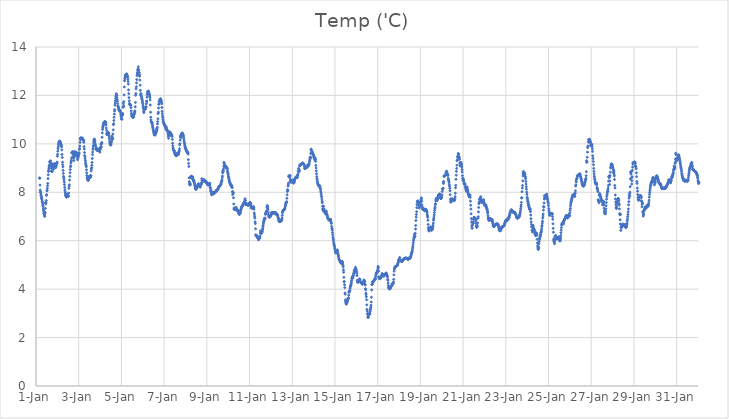
| Category | Temp ('C) |
|---|---|
| 44927.166666666664 | 8.597 |
| 44927.177083333336 | 8.574 |
| 44927.1875 | 8.298 |
| 44927.197916666664 | 8.091 |
| 44927.208333333336 | 8.01 |
| 44927.21875 | 8.003 |
| 44927.229166666664 | 7.937 |
| 44927.239583333336 | 7.87 |
| 44927.25 | 7.82 |
| 44927.260416666664 | 7.769 |
| 44927.270833333336 | 7.728 |
| 44927.28125 | 7.687 |
| 44927.291666666664 | 7.626 |
| 44927.302083333336 | 7.58 |
| 44927.3125 | 7.517 |
| 44927.322916666664 | 7.456 |
| 44927.333333333336 | 7.403 |
| 44927.34375 | 7.31 |
| 44927.354166666664 | 7.248 |
| 44927.364583333336 | 7.188 |
| 44927.375 | 7.131 |
| 44927.385416666664 | 7.114 |
| 44927.395833333336 | 7.039 |
| 44927.40625 | 7.006 |
| 44927.416666666664 | 7.11 |
| 44927.427083333336 | 7.167 |
| 44927.4375 | 7.335 |
| 44927.447916666664 | 7.564 |
| 44927.458333333336 | 7.52 |
| 44927.46875 | 7.586 |
| 44927.479166666664 | 7.659 |
| 44927.489583333336 | 7.872 |
| 44927.5 | 7.902 |
| 44927.510416666664 | 8.062 |
| 44927.520833333336 | 8.07 |
| 44927.53125 | 8.162 |
| 44927.541666666664 | 8.268 |
| 44927.552083333336 | 8.366 |
| 44927.5625 | 8.565 |
| 44927.572916666664 | 8.722 |
| 44927.583333333336 | 8.859 |
| 44927.59375 | 8.916 |
| 44927.604166666664 | 8.991 |
| 44927.614583333336 | 9.06 |
| 44927.625 | 9.103 |
| 44927.635416666664 | 9.129 |
| 44927.645833333336 | 9.266 |
| 44927.65625 | 9.241 |
| 44927.666666666664 | 9.242 |
| 44927.677083333336 | 9.301 |
| 44927.6875 | 9.19 |
| 44927.697916666664 | 9.114 |
| 44927.708333333336 | 9.071 |
| 44927.71875 | 8.99 |
| 44927.729166666664 | 8.885 |
| 44927.739583333336 | 8.86 |
| 44927.75 | 8.853 |
| 44927.760416666664 | 8.885 |
| 44927.770833333336 | 9.034 |
| 44927.78125 | 9.079 |
| 44927.791666666664 | 9.177 |
| 44927.802083333336 | 9.139 |
| 44927.8125 | 9.042 |
| 44927.822916666664 | 8.965 |
| 44927.833333333336 | 9.037 |
| 44927.84375 | 9.096 |
| 44927.854166666664 | 9.134 |
| 44927.864583333336 | 9.171 |
| 44927.875 | 9.176 |
| 44927.885416666664 | 9.139 |
| 44927.895833333336 | 9.076 |
| 44927.90625 | 9.078 |
| 44927.916666666664 | 9.014 |
| 44927.927083333336 | 9.057 |
| 44927.9375 | 9.12 |
| 44927.947916666664 | 9.083 |
| 44927.958333333336 | 9.163 |
| 44927.96875 | 9.212 |
| 44927.979166666664 | 9.198 |
| 44927.989583333336 | 9.247 |
| 44928.0 | 9.489 |
| 44928.010416666664 | 9.567 |
| 44928.020833333336 | 9.696 |
| 44928.03125 | 9.805 |
| 44928.041666666664 | 9.88 |
| 44928.052083333336 | 9.96 |
| 44928.0625 | 10.023 |
| 44928.072916666664 | 10.043 |
| 44928.083333333336 | 10.069 |
| 44928.09375 | 10.095 |
| 44928.104166666664 | 10.111 |
| 44928.114583333336 | 10.109 |
| 44928.125 | 10.095 |
| 44928.135416666664 | 10.062 |
| 44928.145833333336 | 10.047 |
| 44928.15625 | 10.026 |
| 44928.166666666664 | 9.985 |
| 44928.177083333336 | 9.968 |
| 44928.1875 | 9.918 |
| 44928.197916666664 | 9.877 |
| 44928.208333333336 | 9.75 |
| 44928.21875 | 9.565 |
| 44928.229166666664 | 9.439 |
| 44928.239583333336 | 9.241 |
| 44928.25 | 9.139 |
| 44928.260416666664 | 9.048 |
| 44928.270833333336 | 8.906 |
| 44928.28125 | 8.78 |
| 44928.291666666664 | 8.653 |
| 44928.302083333336 | 8.597 |
| 44928.3125 | 8.526 |
| 44928.322916666664 | 8.428 |
| 44928.333333333336 | 8.322 |
| 44928.34375 | 8.205 |
| 44928.354166666664 | 8.104 |
| 44928.364583333336 | 8.021 |
| 44928.375 | 7.962 |
| 44928.385416666664 | 7.9 |
| 44928.395833333336 | 7.863 |
| 44928.40625 | 7.836 |
| 44928.416666666664 | 7.818 |
| 44928.427083333336 | 7.807 |
| 44928.4375 | 7.809 |
| 44928.447916666664 | 7.931 |
| 44928.458333333336 | 7.845 |
| 44928.46875 | 7.857 |
| 44928.479166666664 | 7.848 |
| 44928.489583333336 | 7.824 |
| 44928.5 | 7.828 |
| 44928.510416666664 | 7.868 |
| 44928.520833333336 | 7.851 |
| 44928.53125 | 7.967 |
| 44928.541666666664 | 8.162 |
| 44928.552083333336 | 8.256 |
| 44928.5625 | 8.308 |
| 44928.572916666664 | 8.503 |
| 44928.583333333336 | 8.657 |
| 44928.59375 | 8.806 |
| 44928.604166666664 | 8.938 |
| 44928.614583333336 | 9.049 |
| 44928.625 | 9.095 |
| 44928.635416666664 | 9.212 |
| 44928.645833333336 | 9.281 |
| 44928.65625 | 9.329 |
| 44928.666666666664 | 9.421 |
| 44928.677083333336 | 9.629 |
| 44928.6875 | 9.644 |
| 44928.697916666664 | 9.641 |
| 44928.708333333336 | 9.681 |
| 44928.71875 | 9.668 |
| 44928.729166666664 | 9.61 |
| 44928.739583333336 | 9.55 |
| 44928.75 | 9.468 |
| 44928.760416666664 | 9.413 |
| 44928.770833333336 | 9.311 |
| 44928.78125 | 9.442 |
| 44928.791666666664 | 9.641 |
| 44928.802083333336 | 9.681 |
| 44928.8125 | 9.645 |
| 44928.822916666664 | 9.545 |
| 44928.833333333336 | 9.517 |
| 44928.84375 | 9.55 |
| 44928.854166666664 | 9.598 |
| 44928.864583333336 | 9.66 |
| 44928.875 | 9.647 |
| 44928.885416666664 | 9.646 |
| 44928.895833333336 | 9.644 |
| 44928.90625 | 9.63 |
| 44928.916666666664 | 9.604 |
| 44928.927083333336 | 9.534 |
| 44928.9375 | 9.47 |
| 44928.947916666664 | 9.346 |
| 44928.958333333336 | 9.406 |
| 44928.96875 | 9.448 |
| 44928.979166666664 | 9.484 |
| 44928.989583333336 | 9.533 |
| 44929.0 | 9.596 |
| 44929.010416666664 | 9.565 |
| 44929.020833333336 | 9.631 |
| 44929.03125 | 9.767 |
| 44929.041666666664 | 9.81 |
| 44929.052083333336 | 9.912 |
| 44929.0625 | 10.06 |
| 44929.072916666664 | 10.179 |
| 44929.083333333336 | 10.229 |
| 44929.09375 | 10.247 |
| 44929.104166666664 | 10.238 |
| 44929.114583333336 | 10.231 |
| 44929.125 | 10.231 |
| 44929.135416666664 | 10.215 |
| 44929.145833333336 | 10.223 |
| 44929.15625 | 10.232 |
| 44929.166666666664 | 10.242 |
| 44929.177083333336 | 10.217 |
| 44929.1875 | 10.185 |
| 44929.197916666664 | 10.157 |
| 44929.208333333336 | 10.163 |
| 44929.21875 | 10.157 |
| 44929.229166666664 | 10.138 |
| 44929.239583333336 | 10.063 |
| 44929.25 | 9.888 |
| 44929.260416666664 | 9.787 |
| 44929.270833333336 | 9.64 |
| 44929.28125 | 9.515 |
| 44929.291666666664 | 9.467 |
| 44929.302083333336 | 9.379 |
| 44929.3125 | 9.301 |
| 44929.322916666664 | 9.214 |
| 44929.333333333336 | 9.156 |
| 44929.34375 | 9.106 |
| 44929.354166666664 | 9.05 |
| 44929.364583333336 | 8.927 |
| 44929.375 | 8.805 |
| 44929.385416666664 | 8.692 |
| 44929.395833333336 | 8.608 |
| 44929.40625 | 8.563 |
| 44929.416666666664 | 8.53 |
| 44929.427083333336 | 8.51 |
| 44929.4375 | 8.502 |
| 44929.447916666664 | 8.498 |
| 44929.458333333336 | 8.501 |
| 44929.46875 | 8.637 |
| 44929.479166666664 | 8.619 |
| 44929.489583333336 | 8.611 |
| 44929.5 | 8.604 |
| 44929.510416666664 | 8.663 |
| 44929.520833333336 | 8.605 |
| 44929.53125 | 8.667 |
| 44929.541666666664 | 8.68 |
| 44929.552083333336 | 8.621 |
| 44929.5625 | 8.682 |
| 44929.572916666664 | 8.684 |
| 44929.583333333336 | 8.882 |
| 44929.59375 | 8.961 |
| 44929.604166666664 | 9.016 |
| 44929.614583333336 | 9.115 |
| 44929.625 | 9.234 |
| 44929.635416666664 | 9.394 |
| 44929.645833333336 | 9.555 |
| 44929.65625 | 9.662 |
| 44929.666666666664 | 9.776 |
| 44929.677083333336 | 9.868 |
| 44929.6875 | 9.936 |
| 44929.697916666664 | 10.047 |
| 44929.708333333336 | 10.116 |
| 44929.71875 | 10.175 |
| 44929.729166666664 | 10.195 |
| 44929.739583333336 | 10.185 |
| 44929.75 | 10.142 |
| 44929.760416666664 | 10.081 |
| 44929.770833333336 | 9.997 |
| 44929.78125 | 9.951 |
| 44929.791666666664 | 9.911 |
| 44929.802083333336 | 9.791 |
| 44929.8125 | 9.786 |
| 44929.822916666664 | 9.824 |
| 44929.833333333336 | 9.817 |
| 44929.84375 | 9.777 |
| 44929.854166666664 | 9.742 |
| 44929.864583333336 | 9.733 |
| 44929.875 | 9.731 |
| 44929.885416666664 | 9.733 |
| 44929.895833333336 | 9.757 |
| 44929.90625 | 9.776 |
| 44929.916666666664 | 9.78 |
| 44929.927083333336 | 9.768 |
| 44929.9375 | 9.755 |
| 44929.947916666664 | 9.736 |
| 44929.958333333336 | 9.717 |
| 44929.96875 | 9.711 |
| 44929.979166666664 | 9.691 |
| 44929.989583333336 | 9.658 |
| 44930.0 | 9.764 |
| 44930.010416666664 | 9.829 |
| 44930.020833333336 | 9.797 |
| 44930.03125 | 9.878 |
| 44930.041666666664 | 9.993 |
| 44930.052083333336 | 9.98 |
| 44930.0625 | 9.878 |
| 44930.072916666664 | 10.036 |
| 44930.083333333336 | 10.053 |
| 44930.09375 | 10.271 |
| 44930.104166666664 | 10.451 |
| 44930.114583333336 | 10.591 |
| 44930.125 | 10.664 |
| 44930.135416666664 | 10.718 |
| 44930.145833333336 | 10.76 |
| 44930.15625 | 10.799 |
| 44930.166666666664 | 10.835 |
| 44930.177083333336 | 10.857 |
| 44930.1875 | 10.878 |
| 44930.197916666664 | 10.899 |
| 44930.208333333336 | 10.906 |
| 44930.21875 | 10.911 |
| 44930.229166666664 | 10.915 |
| 44930.239583333336 | 10.911 |
| 44930.25 | 10.894 |
| 44930.260416666664 | 10.886 |
| 44930.270833333336 | 10.856 |
| 44930.28125 | 10.776 |
| 44930.291666666664 | 10.652 |
| 44930.302083333336 | 10.555 |
| 44930.3125 | 10.429 |
| 44930.322916666664 | 10.378 |
| 44930.333333333336 | 10.391 |
| 44930.34375 | 10.405 |
| 44930.354166666664 | 10.454 |
| 44930.364583333336 | 10.463 |
| 44930.375 | 10.462 |
| 44930.385416666664 | 10.466 |
| 44930.395833333336 | 10.457 |
| 44930.40625 | 10.42 |
| 44930.416666666664 | 10.357 |
| 44930.427083333336 | 10.279 |
| 44930.4375 | 10.204 |
| 44930.447916666664 | 10.108 |
| 44930.458333333336 | 10.042 |
| 44930.46875 | 10.001 |
| 44930.479166666664 | 9.983 |
| 44930.489583333336 | 9.959 |
| 44930.5 | 9.956 |
| 44930.510416666664 | 9.956 |
| 44930.520833333336 | 10.094 |
| 44930.53125 | 10.056 |
| 44930.541666666664 | 10.201 |
| 44930.552083333336 | 10.292 |
| 44930.5625 | 10.32 |
| 44930.572916666664 | 10.223 |
| 44930.583333333336 | 10.178 |
| 44930.59375 | 10.233 |
| 44930.604166666664 | 10.41 |
| 44930.614583333336 | 10.577 |
| 44930.625 | 10.79 |
| 44930.635416666664 | 10.834 |
| 44930.645833333336 | 10.964 |
| 44930.65625 | 11.1 |
| 44930.666666666664 | 11.227 |
| 44930.677083333336 | 11.353 |
| 44930.6875 | 11.412 |
| 44930.697916666664 | 11.597 |
| 44930.708333333336 | 11.69 |
| 44930.71875 | 11.774 |
| 44930.729166666664 | 11.872 |
| 44930.739583333336 | 11.947 |
| 44930.75 | 11.996 |
| 44930.760416666664 | 12.069 |
| 44930.770833333336 | 12.025 |
| 44930.78125 | 11.996 |
| 44930.791666666664 | 11.907 |
| 44930.802083333336 | 11.815 |
| 44930.8125 | 11.764 |
| 44930.822916666664 | 11.662 |
| 44930.833333333336 | 11.562 |
| 44930.84375 | 11.56 |
| 44930.854166666664 | 11.52 |
| 44930.864583333336 | 11.484 |
| 44930.875 | 11.437 |
| 44930.885416666664 | 11.406 |
| 44930.895833333336 | 11.382 |
| 44930.90625 | 11.38 |
| 44930.916666666664 | 11.377 |
| 44930.927083333336 | 11.373 |
| 44930.9375 | 11.358 |
| 44930.947916666664 | 11.343 |
| 44930.958333333336 | 11.293 |
| 44930.96875 | 11.216 |
| 44930.979166666664 | 11.148 |
| 44930.989583333336 | 11.135 |
| 44931.0 | 11.03 |
| 44931.010416666664 | 11.063 |
| 44931.020833333336 | 11.014 |
| 44931.03125 | 11.175 |
| 44931.041666666664 | 11.195 |
| 44931.052083333336 | 11.204 |
| 44931.0625 | 11.253 |
| 44931.072916666664 | 11.508 |
| 44931.083333333336 | 11.676 |
| 44931.09375 | 11.536 |
| 44931.104166666664 | 11.586 |
| 44931.114583333336 | 11.743 |
| 44931.125 | 12.02 |
| 44931.135416666664 | 12.351 |
| 44931.145833333336 | 12.605 |
| 44931.15625 | 12.685 |
| 44931.166666666664 | 12.759 |
| 44931.177083333336 | 12.795 |
| 44931.1875 | 12.828 |
| 44931.197916666664 | 12.839 |
| 44931.208333333336 | 12.852 |
| 44931.21875 | 12.865 |
| 44931.229166666664 | 12.871 |
| 44931.239583333336 | 12.884 |
| 44931.25 | 12.882 |
| 44931.260416666664 | 12.842 |
| 44931.270833333336 | 12.821 |
| 44931.28125 | 12.805 |
| 44931.291666666664 | 12.741 |
| 44931.302083333336 | 12.672 |
| 44931.3125 | 12.579 |
| 44931.322916666664 | 12.47 |
| 44931.333333333336 | 12.227 |
| 44931.34375 | 12.073 |
| 44931.354166666664 | 11.909 |
| 44931.364583333336 | 11.779 |
| 44931.375 | 11.669 |
| 44931.385416666664 | 11.632 |
| 44931.395833333336 | 11.616 |
| 44931.40625 | 11.603 |
| 44931.416666666664 | 11.606 |
| 44931.427083333336 | 11.619 |
| 44931.4375 | 11.593 |
| 44931.447916666664 | 11.496 |
| 44931.458333333336 | 11.362 |
| 44931.46875 | 11.26 |
| 44931.479166666664 | 11.195 |
| 44931.489583333336 | 11.156 |
| 44931.5 | 11.142 |
| 44931.510416666664 | 11.131 |
| 44931.520833333336 | 11.115 |
| 44931.53125 | 11.096 |
| 44931.541666666664 | 11.106 |
| 44931.552083333336 | 11.095 |
| 44931.5625 | 11.126 |
| 44931.572916666664 | 11.148 |
| 44931.583333333336 | 11.198 |
| 44931.59375 | 11.24 |
| 44931.604166666664 | 11.224 |
| 44931.614583333336 | 11.317 |
| 44931.625 | 11.31 |
| 44931.635416666664 | 11.363 |
| 44931.645833333336 | 11.532 |
| 44931.65625 | 11.708 |
| 44931.666666666664 | 12.009 |
| 44931.677083333336 | 12.074 |
| 44931.6875 | 12.272 |
| 44931.697916666664 | 12.356 |
| 44931.708333333336 | 12.518 |
| 44931.71875 | 12.654 |
| 44931.729166666664 | 12.822 |
| 44931.739583333336 | 12.888 |
| 44931.75 | 12.94 |
| 44931.760416666664 | 13.022 |
| 44931.770833333336 | 13.067 |
| 44931.78125 | 13.096 |
| 44931.791666666664 | 13.182 |
| 44931.802083333336 | 13.052 |
| 44931.8125 | 13.045 |
| 44931.822916666664 | 12.931 |
| 44931.833333333336 | 12.933 |
| 44931.84375 | 12.851 |
| 44931.854166666664 | 12.794 |
| 44931.864583333336 | 12.635 |
| 44931.875 | 12.423 |
| 44931.885416666664 | 12.208 |
| 44931.895833333336 | 12.034 |
| 44931.90625 | 12.022 |
| 44931.916666666664 | 12.077 |
| 44931.927083333336 | 12.015 |
| 44931.9375 | 11.957 |
| 44931.947916666664 | 11.901 |
| 44931.958333333336 | 11.861 |
| 44931.96875 | 11.831 |
| 44931.979166666664 | 11.772 |
| 44931.989583333336 | 11.717 |
| 44932.0 | 11.656 |
| 44932.010416666664 | 11.576 |
| 44932.020833333336 | 11.511 |
| 44932.03125 | 11.454 |
| 44932.041666666664 | 11.349 |
| 44932.052083333336 | 11.288 |
| 44932.0625 | 11.432 |
| 44932.072916666664 | 11.428 |
| 44932.083333333336 | 11.473 |
| 44932.09375 | 11.418 |
| 44932.104166666664 | 11.45 |
| 44932.114583333336 | 11.44 |
| 44932.125 | 11.454 |
| 44932.135416666664 | 11.496 |
| 44932.145833333336 | 11.515 |
| 44932.15625 | 11.534 |
| 44932.166666666664 | 11.651 |
| 44932.177083333336 | 11.77 |
| 44932.1875 | 11.73 |
| 44932.197916666664 | 11.928 |
| 44932.208333333336 | 12.038 |
| 44932.21875 | 12.095 |
| 44932.229166666664 | 12.16 |
| 44932.239583333336 | 12.162 |
| 44932.25 | 12.17 |
| 44932.260416666664 | 12.178 |
| 44932.270833333336 | 12.162 |
| 44932.28125 | 12.131 |
| 44932.291666666664 | 12.075 |
| 44932.302083333336 | 12.045 |
| 44932.3125 | 12.026 |
| 44932.322916666664 | 11.973 |
| 44932.333333333336 | 11.914 |
| 44932.34375 | 11.812 |
| 44932.354166666664 | 11.606 |
| 44932.364583333336 | 11.307 |
| 44932.375 | 11.1 |
| 44932.385416666664 | 10.988 |
| 44932.395833333336 | 10.927 |
| 44932.40625 | 10.891 |
| 44932.416666666664 | 10.887 |
| 44932.427083333336 | 10.884 |
| 44932.4375 | 10.85 |
| 44932.447916666664 | 10.792 |
| 44932.458333333336 | 10.735 |
| 44932.46875 | 10.69 |
| 44932.479166666664 | 10.647 |
| 44932.489583333336 | 10.593 |
| 44932.5 | 10.537 |
| 44932.510416666664 | 10.491 |
| 44932.520833333336 | 10.446 |
| 44932.53125 | 10.413 |
| 44932.541666666664 | 10.392 |
| 44932.552083333336 | 10.377 |
| 44932.5625 | 10.368 |
| 44932.572916666664 | 10.364 |
| 44932.583333333336 | 10.382 |
| 44932.59375 | 10.462 |
| 44932.604166666664 | 10.433 |
| 44932.614583333336 | 10.456 |
| 44932.625 | 10.484 |
| 44932.635416666664 | 10.545 |
| 44932.645833333336 | 10.535 |
| 44932.65625 | 10.625 |
| 44932.666666666664 | 10.583 |
| 44932.677083333336 | 10.681 |
| 44932.6875 | 10.824 |
| 44932.697916666664 | 10.922 |
| 44932.708333333336 | 11.035 |
| 44932.71875 | 11.249 |
| 44932.729166666664 | 11.307 |
| 44932.739583333336 | 11.483 |
| 44932.75 | 11.636 |
| 44932.760416666664 | 11.645 |
| 44932.770833333336 | 11.749 |
| 44932.78125 | 11.749 |
| 44932.791666666664 | 11.796 |
| 44932.802083333336 | 11.835 |
| 44932.8125 | 11.832 |
| 44932.822916666664 | 11.853 |
| 44932.833333333336 | 11.862 |
| 44932.84375 | 11.822 |
| 44932.854166666664 | 11.777 |
| 44932.864583333336 | 11.767 |
| 44932.875 | 11.718 |
| 44932.885416666664 | 11.656 |
| 44932.895833333336 | 11.5 |
| 44932.90625 | 11.345 |
| 44932.916666666664 | 11.249 |
| 44932.927083333336 | 11.153 |
| 44932.9375 | 11.082 |
| 44932.947916666664 | 11.003 |
| 44932.958333333336 | 10.938 |
| 44932.96875 | 10.896 |
| 44932.979166666664 | 10.869 |
| 44932.989583333336 | 10.841 |
| 44933.0 | 10.815 |
| 44933.010416666664 | 10.791 |
| 44933.020833333336 | 10.776 |
| 44933.03125 | 10.762 |
| 44933.041666666664 | 10.743 |
| 44933.052083333336 | 10.716 |
| 44933.0625 | 10.691 |
| 44933.072916666664 | 10.612 |
| 44933.083333333336 | 10.723 |
| 44933.09375 | 10.682 |
| 44933.104166666664 | 10.655 |
| 44933.114583333336 | 10.627 |
| 44933.125 | 10.585 |
| 44933.135416666664 | 10.572 |
| 44933.145833333336 | 10.553 |
| 44933.15625 | 10.53 |
| 44933.166666666664 | 10.52 |
| 44933.177083333336 | 10.454 |
| 44933.1875 | 10.376 |
| 44933.197916666664 | 10.31 |
| 44933.208333333336 | 10.229 |
| 44933.21875 | 10.387 |
| 44933.229166666664 | 10.378 |
| 44933.239583333336 | 10.444 |
| 44933.25 | 10.473 |
| 44933.260416666664 | 10.496 |
| 44933.270833333336 | 10.471 |
| 44933.28125 | 10.479 |
| 44933.291666666664 | 10.46 |
| 44933.302083333336 | 10.439 |
| 44933.3125 | 10.427 |
| 44933.322916666664 | 10.337 |
| 44933.333333333336 | 10.372 |
| 44933.34375 | 10.345 |
| 44933.354166666664 | 10.369 |
| 44933.364583333336 | 10.358 |
| 44933.375 | 10.306 |
| 44933.385416666664 | 10.185 |
| 44933.395833333336 | 10.025 |
| 44933.40625 | 9.924 |
| 44933.416666666664 | 9.836 |
| 44933.427083333336 | 9.784 |
| 44933.4375 | 9.75 |
| 44933.447916666664 | 9.724 |
| 44933.458333333336 | 9.722 |
| 44933.46875 | 9.72 |
| 44933.479166666664 | 9.698 |
| 44933.489583333336 | 9.643 |
| 44933.5 | 9.603 |
| 44933.510416666664 | 9.58 |
| 44933.520833333336 | 9.557 |
| 44933.53125 | 9.543 |
| 44933.541666666664 | 9.527 |
| 44933.552083333336 | 9.521 |
| 44933.5625 | 9.513 |
| 44933.572916666664 | 9.511 |
| 44933.583333333336 | 9.522 |
| 44933.59375 | 9.53 |
| 44933.604166666664 | 9.563 |
| 44933.614583333336 | 9.615 |
| 44933.625 | 9.598 |
| 44933.635416666664 | 9.577 |
| 44933.645833333336 | 9.563 |
| 44933.65625 | 9.585 |
| 44933.666666666664 | 9.568 |
| 44933.677083333336 | 9.579 |
| 44933.6875 | 9.658 |
| 44933.697916666664 | 9.678 |
| 44933.708333333336 | 9.718 |
| 44933.71875 | 9.798 |
| 44933.729166666664 | 9.958 |
| 44933.739583333336 | 10.009 |
| 44933.75 | 10.153 |
| 44933.760416666664 | 10.287 |
| 44933.770833333336 | 10.329 |
| 44933.78125 | 10.25 |
| 44933.791666666664 | 10.358 |
| 44933.802083333336 | 10.376 |
| 44933.8125 | 10.404 |
| 44933.822916666664 | 10.426 |
| 44933.833333333336 | 10.42 |
| 44933.84375 | 10.44 |
| 44933.854166666664 | 10.45 |
| 44933.864583333336 | 10.408 |
| 44933.875 | 10.386 |
| 44933.885416666664 | 10.376 |
| 44933.895833333336 | 10.342 |
| 44933.90625 | 10.299 |
| 44933.916666666664 | 10.239 |
| 44933.927083333336 | 10.163 |
| 44933.9375 | 10.089 |
| 44933.947916666664 | 10.038 |
| 44933.958333333336 | 10.001 |
| 44933.96875 | 9.94 |
| 44933.979166666664 | 9.882 |
| 44933.989583333336 | 9.849 |
| 44934.0 | 9.816 |
| 44934.010416666664 | 9.796 |
| 44934.020833333336 | 9.772 |
| 44934.03125 | 9.75 |
| 44934.041666666664 | 9.733 |
| 44934.052083333336 | 9.71 |
| 44934.0625 | 9.694 |
| 44934.072916666664 | 9.669 |
| 44934.083333333336 | 9.634 |
| 44934.09375 | 9.641 |
| 44934.104166666664 | 9.633 |
| 44934.114583333336 | 9.656 |
| 44934.125 | 9.58 |
| 44934.135416666664 | 9.347 |
| 44934.145833333336 | 9.192 |
| 44934.15625 | 9.066 |
| 44934.166666666664 | 8.591 |
| 44934.177083333336 | 8.435 |
| 44934.1875 | 8.343 |
| 44934.197916666664 | 8.335 |
| 44934.208333333336 | 8.299 |
| 44934.21875 | 8.366 |
| 44934.229166666664 | 8.318 |
| 44934.239583333336 | 8.628 |
| 44934.25 | 8.653 |
| 44934.260416666664 | 8.63 |
| 44934.270833333336 | 8.649 |
| 44934.28125 | 8.661 |
| 44934.291666666664 | 8.602 |
| 44934.302083333336 | 8.579 |
| 44934.3125 | 8.596 |
| 44934.322916666664 | 8.614 |
| 44934.333333333336 | 8.638 |
| 44934.34375 | 8.605 |
| 44934.354166666664 | 8.522 |
| 44934.364583333336 | 8.464 |
| 44934.375 | 8.516 |
| 44934.385416666664 | 8.508 |
| 44934.395833333336 | 8.474 |
| 44934.40625 | 8.426 |
| 44934.416666666664 | 8.388 |
| 44934.427083333336 | 8.335 |
| 44934.4375 | 8.285 |
| 44934.447916666664 | 8.225 |
| 44934.458333333336 | 8.177 |
| 44934.46875 | 8.148 |
| 44934.479166666664 | 8.133 |
| 44934.489583333336 | 8.126 |
| 44934.5 | 8.136 |
| 44934.510416666664 | 8.154 |
| 44934.520833333336 | 8.167 |
| 44934.53125 | 8.189 |
| 44934.541666666664 | 8.22 |
| 44934.552083333336 | 8.251 |
| 44934.5625 | 8.266 |
| 44934.572916666664 | 8.274 |
| 44934.583333333336 | 8.312 |
| 44934.59375 | 8.329 |
| 44934.604166666664 | 8.334 |
| 44934.614583333336 | 8.346 |
| 44934.625 | 8.308 |
| 44934.635416666664 | 8.331 |
| 44934.645833333336 | 8.271 |
| 44934.65625 | 8.24 |
| 44934.666666666664 | 8.267 |
| 44934.677083333336 | 8.262 |
| 44934.6875 | 8.209 |
| 44934.697916666664 | 8.267 |
| 44934.708333333336 | 8.313 |
| 44934.71875 | 8.319 |
| 44934.729166666664 | 8.315 |
| 44934.739583333336 | 8.346 |
| 44934.75 | 8.378 |
| 44934.760416666664 | 8.563 |
| 44934.770833333336 | 8.486 |
| 44934.78125 | 8.421 |
| 44934.791666666664 | 8.446 |
| 44934.802083333336 | 8.453 |
| 44934.8125 | 8.466 |
| 44934.822916666664 | 8.498 |
| 44934.833333333336 | 8.504 |
| 44934.84375 | 8.524 |
| 44934.854166666664 | 8.517 |
| 44934.864583333336 | 8.51 |
| 44934.875 | 8.51 |
| 44934.885416666664 | 8.489 |
| 44934.895833333336 | 8.473 |
| 44934.90625 | 8.472 |
| 44934.916666666664 | 8.471 |
| 44934.927083333336 | 8.46 |
| 44934.9375 | 8.429 |
| 44934.947916666664 | 8.43 |
| 44934.958333333336 | 8.434 |
| 44934.96875 | 8.434 |
| 44934.979166666664 | 8.415 |
| 44934.989583333336 | 8.38 |
| 44935.0 | 8.368 |
| 44935.010416666664 | 8.351 |
| 44935.020833333336 | 8.341 |
| 44935.03125 | 8.327 |
| 44935.041666666664 | 8.317 |
| 44935.052083333336 | 8.306 |
| 44935.0625 | 8.304 |
| 44935.072916666664 | 8.31 |
| 44935.083333333336 | 8.32 |
| 44935.09375 | 8.345 |
| 44935.104166666664 | 8.364 |
| 44935.114583333336 | 8.343 |
| 44935.125 | 8.371 |
| 44935.135416666664 | 8.363 |
| 44935.145833333336 | 8.302 |
| 44935.15625 | 8.201 |
| 44935.166666666664 | 8.181 |
| 44935.177083333336 | 8.055 |
| 44935.1875 | 8.104 |
| 44935.197916666664 | 8.016 |
| 44935.208333333336 | 7.927 |
| 44935.21875 | 7.925 |
| 44935.229166666664 | 7.897 |
| 44935.239583333336 | 8.013 |
| 44935.25 | 7.979 |
| 44935.260416666664 | 7.944 |
| 44935.270833333336 | 7.978 |
| 44935.28125 | 7.953 |
| 44935.291666666664 | 7.937 |
| 44935.302083333336 | 7.93 |
| 44935.3125 | 7.947 |
| 44935.322916666664 | 7.961 |
| 44935.333333333336 | 7.985 |
| 44935.34375 | 8.001 |
| 44935.354166666664 | 7.986 |
| 44935.364583333336 | 7.999 |
| 44935.375 | 7.988 |
| 44935.385416666664 | 7.998 |
| 44935.395833333336 | 8.029 |
| 44935.40625 | 8.03 |
| 44935.416666666664 | 8.017 |
| 44935.427083333336 | 8.014 |
| 44935.4375 | 8.045 |
| 44935.447916666664 | 8.071 |
| 44935.458333333336 | 8.084 |
| 44935.46875 | 8.085 |
| 44935.479166666664 | 8.096 |
| 44935.489583333336 | 8.097 |
| 44935.5 | 8.105 |
| 44935.510416666664 | 8.119 |
| 44935.520833333336 | 8.136 |
| 44935.53125 | 8.154 |
| 44935.541666666664 | 8.175 |
| 44935.552083333336 | 8.205 |
| 44935.5625 | 8.224 |
| 44935.572916666664 | 8.245 |
| 44935.583333333336 | 8.248 |
| 44935.59375 | 8.256 |
| 44935.604166666664 | 8.261 |
| 44935.614583333336 | 8.262 |
| 44935.625 | 8.28 |
| 44935.635416666664 | 8.301 |
| 44935.645833333336 | 8.324 |
| 44935.65625 | 8.327 |
| 44935.666666666664 | 8.377 |
| 44935.677083333336 | 8.42 |
| 44935.6875 | 8.437 |
| 44935.697916666664 | 8.466 |
| 44935.708333333336 | 8.503 |
| 44935.71875 | 8.592 |
| 44935.729166666664 | 8.67 |
| 44935.739583333336 | 8.807 |
| 44935.75 | 8.843 |
| 44935.760416666664 | 8.908 |
| 44935.770833333336 | 8.852 |
| 44935.78125 | 8.958 |
| 44935.791666666664 | 9.062 |
| 44935.802083333336 | 9.239 |
| 44935.8125 | 9.201 |
| 44935.822916666664 | 9.155 |
| 44935.833333333336 | 9.1 |
| 44935.84375 | 9.061 |
| 44935.854166666664 | 9.081 |
| 44935.864583333336 | 9.058 |
| 44935.875 | 9.069 |
| 44935.885416666664 | 9.09 |
| 44935.895833333336 | 9.029 |
| 44935.90625 | 9.018 |
| 44935.916666666664 | 9.029 |
| 44935.927083333336 | 9.025 |
| 44935.9375 | 9.01 |
| 44935.947916666664 | 8.991 |
| 44935.958333333336 | 8.957 |
| 44935.96875 | 8.876 |
| 44935.979166666664 | 8.826 |
| 44935.989583333336 | 8.78 |
| 44936.0 | 8.72 |
| 44936.010416666664 | 8.66 |
| 44936.020833333336 | 8.618 |
| 44936.03125 | 8.569 |
| 44936.041666666664 | 8.519 |
| 44936.052083333336 | 8.469 |
| 44936.0625 | 8.441 |
| 44936.072916666664 | 8.407 |
| 44936.083333333336 | 8.383 |
| 44936.09375 | 8.356 |
| 44936.104166666664 | 8.328 |
| 44936.114583333336 | 8.303 |
| 44936.125 | 8.299 |
| 44936.135416666664 | 8.294 |
| 44936.145833333336 | 8.271 |
| 44936.15625 | 8.256 |
| 44936.166666666664 | 8.276 |
| 44936.177083333336 | 8.216 |
| 44936.1875 | 8.189 |
| 44936.197916666664 | 8.03 |
| 44936.208333333336 | 7.905 |
| 44936.21875 | 8.017 |
| 44936.229166666664 | 7.983 |
| 44936.239583333336 | 7.957 |
| 44936.25 | 7.776 |
| 44936.260416666664 | 7.517 |
| 44936.270833333336 | 7.346 |
| 44936.28125 | 7.294 |
| 44936.291666666664 | 7.288 |
| 44936.302083333336 | 7.334 |
| 44936.3125 | 7.357 |
| 44936.322916666664 | 7.338 |
| 44936.333333333336 | 7.327 |
| 44936.34375 | 7.354 |
| 44936.354166666664 | 7.34 |
| 44936.364583333336 | 7.305 |
| 44936.375 | 7.372 |
| 44936.385416666664 | 7.31 |
| 44936.395833333336 | 7.255 |
| 44936.40625 | 7.249 |
| 44936.416666666664 | 7.272 |
| 44936.427083333336 | 7.272 |
| 44936.4375 | 7.27 |
| 44936.447916666664 | 7.224 |
| 44936.458333333336 | 7.225 |
| 44936.46875 | 7.242 |
| 44936.479166666664 | 7.213 |
| 44936.489583333336 | 7.144 |
| 44936.5 | 7.123 |
| 44936.510416666664 | 7.104 |
| 44936.520833333336 | 7.088 |
| 44936.53125 | 7.09 |
| 44936.541666666664 | 7.105 |
| 44936.552083333336 | 7.126 |
| 44936.5625 | 7.151 |
| 44936.572916666664 | 7.182 |
| 44936.583333333336 | 7.243 |
| 44936.59375 | 7.279 |
| 44936.604166666664 | 7.318 |
| 44936.614583333336 | 7.354 |
| 44936.625 | 7.377 |
| 44936.635416666664 | 7.407 |
| 44936.645833333336 | 7.423 |
| 44936.65625 | 7.434 |
| 44936.666666666664 | 7.451 |
| 44936.677083333336 | 7.452 |
| 44936.6875 | 7.487 |
| 44936.697916666664 | 7.478 |
| 44936.708333333336 | 7.519 |
| 44936.71875 | 7.553 |
| 44936.729166666664 | 7.544 |
| 44936.739583333336 | 7.562 |
| 44936.75 | 7.563 |
| 44936.760416666664 | 7.585 |
| 44936.770833333336 | 7.615 |
| 44936.78125 | 7.683 |
| 44936.791666666664 | 7.731 |
| 44936.802083333336 | 7.663 |
| 44936.8125 | 7.566 |
| 44936.822916666664 | 7.488 |
| 44936.833333333336 | 7.508 |
| 44936.84375 | 7.52 |
| 44936.854166666664 | 7.509 |
| 44936.864583333336 | 7.518 |
| 44936.875 | 7.524 |
| 44936.885416666664 | 7.503 |
| 44936.895833333336 | 7.499 |
| 44936.90625 | 7.477 |
| 44936.916666666664 | 7.474 |
| 44936.927083333336 | 7.46 |
| 44936.9375 | 7.483 |
| 44936.947916666664 | 7.492 |
| 44936.958333333336 | 7.485 |
| 44936.96875 | 7.475 |
| 44936.979166666664 | 7.484 |
| 44936.989583333336 | 7.528 |
| 44937.0 | 7.556 |
| 44937.010416666664 | 7.578 |
| 44937.020833333336 | 7.58 |
| 44937.03125 | 7.575 |
| 44937.041666666664 | 7.558 |
| 44937.052083333336 | 7.534 |
| 44937.0625 | 7.483 |
| 44937.072916666664 | 7.426 |
| 44937.083333333336 | 7.366 |
| 44937.09375 | 7.357 |
| 44937.104166666664 | 7.359 |
| 44937.114583333336 | 7.357 |
| 44937.125 | 7.349 |
| 44937.135416666664 | 7.341 |
| 44937.145833333336 | 7.337 |
| 44937.15625 | 7.339 |
| 44937.166666666664 | 7.332 |
| 44937.177083333336 | 7.365 |
| 44937.1875 | 7.41 |
| 44937.197916666664 | 7.364 |
| 44937.208333333336 | 7.303 |
| 44937.21875 | 7.147 |
| 44937.229166666664 | 7.072 |
| 44937.239583333336 | 6.993 |
| 44937.25 | 6.932 |
| 44937.260416666664 | 6.782 |
| 44937.270833333336 | 6.707 |
| 44937.28125 | 6.493 |
| 44937.291666666664 | 6.246 |
| 44937.302083333336 | 6.195 |
| 44937.3125 | 6.215 |
| 44937.322916666664 | 6.205 |
| 44937.333333333336 | 6.184 |
| 44937.34375 | 6.199 |
| 44937.354166666664 | 6.193 |
| 44937.364583333336 | 6.157 |
| 44937.375 | 6.128 |
| 44937.385416666664 | 6.128 |
| 44937.395833333336 | 6.113 |
| 44937.40625 | 6.101 |
| 44937.416666666664 | 6.04 |
| 44937.427083333336 | 6.073 |
| 44937.4375 | 6.061 |
| 44937.447916666664 | 6.119 |
| 44937.458333333336 | 6.111 |
| 44937.46875 | 6.119 |
| 44937.479166666664 | 6.121 |
| 44937.489583333336 | 6.191 |
| 44937.5 | 6.313 |
| 44937.510416666664 | 6.407 |
| 44937.520833333336 | 6.315 |
| 44937.53125 | 6.3 |
| 44937.541666666664 | 6.327 |
| 44937.552083333336 | 6.314 |
| 44937.5625 | 6.318 |
| 44937.572916666664 | 6.339 |
| 44937.583333333336 | 6.358 |
| 44937.59375 | 6.387 |
| 44937.604166666664 | 6.443 |
| 44937.614583333336 | 6.497 |
| 44937.625 | 6.568 |
| 44937.635416666664 | 6.625 |
| 44937.645833333336 | 6.693 |
| 44937.65625 | 6.756 |
| 44937.666666666664 | 6.799 |
| 44937.677083333336 | 6.835 |
| 44937.6875 | 6.888 |
| 44937.697916666664 | 6.923 |
| 44937.708333333336 | 6.885 |
| 44937.71875 | 6.918 |
| 44937.729166666664 | 6.939 |
| 44937.739583333336 | 7.094 |
| 44937.75 | 7.1 |
| 44937.760416666664 | 7.134 |
| 44937.770833333336 | 7.162 |
| 44937.78125 | 7.171 |
| 44937.791666666664 | 7.201 |
| 44937.802083333336 | 7.232 |
| 44937.8125 | 7.374 |
| 44937.822916666664 | 7.4 |
| 44937.833333333336 | 7.453 |
| 44937.84375 | 7.428 |
| 44937.854166666664 | 7.354 |
| 44937.864583333336 | 7.296 |
| 44937.875 | 7.179 |
| 44937.885416666664 | 7.084 |
| 44937.895833333336 | 7.023 |
| 44937.90625 | 7.008 |
| 44937.916666666664 | 6.988 |
| 44937.927083333336 | 6.969 |
| 44937.9375 | 6.975 |
| 44937.947916666664 | 6.985 |
| 44937.958333333336 | 6.99 |
| 44937.96875 | 7 |
| 44937.979166666664 | 7.008 |
| 44937.989583333336 | 7.037 |
| 44938.0 | 7.066 |
| 44938.010416666664 | 7.087 |
| 44938.020833333336 | 7.11 |
| 44938.03125 | 7.134 |
| 44938.041666666664 | 7.17 |
| 44938.052083333336 | 7.176 |
| 44938.0625 | 7.157 |
| 44938.072916666664 | 7.115 |
| 44938.083333333336 | 7.125 |
| 44938.09375 | 7.145 |
| 44938.104166666664 | 7.162 |
| 44938.114583333336 | 7.162 |
| 44938.125 | 7.155 |
| 44938.135416666664 | 7.155 |
| 44938.145833333336 | 7.153 |
| 44938.15625 | 7.15 |
| 44938.166666666664 | 7.151 |
| 44938.177083333336 | 7.153 |
| 44938.1875 | 7.157 |
| 44938.197916666664 | 7.163 |
| 44938.208333333336 | 7.154 |
| 44938.21875 | 7.122 |
| 44938.229166666664 | 7.157 |
| 44938.239583333336 | 7.114 |
| 44938.25 | 7.08 |
| 44938.260416666664 | 7.107 |
| 44938.270833333336 | 7.086 |
| 44938.28125 | 7.105 |
| 44938.291666666664 | 7.078 |
| 44938.302083333336 | 7.059 |
| 44938.3125 | 7.048 |
| 44938.322916666664 | 7.022 |
| 44938.333333333336 | 6.962 |
| 44938.34375 | 6.94 |
| 44938.354166666664 | 6.903 |
| 44938.364583333336 | 6.861 |
| 44938.375 | 6.825 |
| 44938.385416666664 | 6.804 |
| 44938.395833333336 | 6.796 |
| 44938.40625 | 6.79 |
| 44938.416666666664 | 6.789 |
| 44938.427083333336 | 6.791 |
| 44938.4375 | 6.791 |
| 44938.447916666664 | 6.798 |
| 44938.458333333336 | 6.818 |
| 44938.46875 | 6.818 |
| 44938.479166666664 | 6.823 |
| 44938.489583333336 | 6.833 |
| 44938.5 | 6.851 |
| 44938.510416666664 | 6.882 |
| 44938.520833333336 | 6.934 |
| 44938.53125 | 7.045 |
| 44938.541666666664 | 7.154 |
| 44938.552083333336 | 7.207 |
| 44938.5625 | 7.228 |
| 44938.572916666664 | 7.239 |
| 44938.583333333336 | 7.255 |
| 44938.59375 | 7.266 |
| 44938.604166666664 | 7.272 |
| 44938.614583333336 | 7.276 |
| 44938.625 | 7.283 |
| 44938.635416666664 | 7.294 |
| 44938.645833333336 | 7.316 |
| 44938.65625 | 7.348 |
| 44938.666666666664 | 7.395 |
| 44938.677083333336 | 7.444 |
| 44938.6875 | 7.492 |
| 44938.697916666664 | 7.534 |
| 44938.708333333336 | 7.565 |
| 44938.71875 | 7.584 |
| 44938.729166666664 | 7.574 |
| 44938.739583333336 | 7.615 |
| 44938.75 | 7.75 |
| 44938.760416666664 | 7.897 |
| 44938.770833333336 | 8.037 |
| 44938.78125 | 8.111 |
| 44938.791666666664 | 8.064 |
| 44938.802083333336 | 8.254 |
| 44938.8125 | 8.308 |
| 44938.822916666664 | 8.381 |
| 44938.833333333336 | 8.652 |
| 44938.84375 | 8.679 |
| 44938.854166666664 | 8.667 |
| 44938.864583333336 | 8.641 |
| 44938.875 | 8.619 |
| 44938.885416666664 | 8.7 |
| 44938.895833333336 | 8.671 |
| 44938.90625 | 8.542 |
| 44938.916666666664 | 8.471 |
| 44938.927083333336 | 8.448 |
| 44938.9375 | 8.419 |
| 44938.947916666664 | 8.421 |
| 44938.958333333336 | 8.429 |
| 44938.96875 | 8.436 |
| 44938.979166666664 | 8.449 |
| 44938.989583333336 | 8.464 |
| 44939.0 | 8.48 |
| 44939.010416666664 | 8.497 |
| 44939.020833333336 | 8.494 |
| 44939.03125 | 8.501 |
| 44939.041666666664 | 8.498 |
| 44939.052083333336 | 8.45 |
| 44939.0625 | 8.386 |
| 44939.072916666664 | 8.38 |
| 44939.083333333336 | 8.41 |
| 44939.09375 | 8.436 |
| 44939.104166666664 | 8.473 |
| 44939.114583333336 | 8.52 |
| 44939.125 | 8.555 |
| 44939.135416666664 | 8.587 |
| 44939.145833333336 | 8.594 |
| 44939.15625 | 8.6 |
| 44939.166666666664 | 8.61 |
| 44939.177083333336 | 8.619 |
| 44939.1875 | 8.626 |
| 44939.197916666664 | 8.637 |
| 44939.208333333336 | 8.656 |
| 44939.21875 | 8.657 |
| 44939.229166666664 | 8.623 |
| 44939.239583333336 | 8.609 |
| 44939.25 | 8.71 |
| 44939.260416666664 | 8.713 |
| 44939.270833333336 | 8.744 |
| 44939.28125 | 8.856 |
| 44939.291666666664 | 8.982 |
| 44939.302083333336 | 8.912 |
| 44939.3125 | 8.901 |
| 44939.322916666664 | 8.849 |
| 44939.333333333336 | 8.925 |
| 44939.34375 | 9.086 |
| 44939.354166666664 | 9.094 |
| 44939.364583333336 | 9.138 |
| 44939.375 | 9.139 |
| 44939.385416666664 | 9.119 |
| 44939.395833333336 | 9.139 |
| 44939.40625 | 9.155 |
| 44939.416666666664 | 9.159 |
| 44939.427083333336 | 9.167 |
| 44939.4375 | 9.176 |
| 44939.447916666664 | 9.184 |
| 44939.458333333336 | 9.195 |
| 44939.46875 | 9.198 |
| 44939.479166666664 | 9.203 |
| 44939.489583333336 | 9.204 |
| 44939.5 | 9.201 |
| 44939.510416666664 | 9.19 |
| 44939.520833333336 | 9.183 |
| 44939.53125 | 9.171 |
| 44939.541666666664 | 9.154 |
| 44939.552083333336 | 9.139 |
| 44939.5625 | 9.119 |
| 44939.572916666664 | 9.058 |
| 44939.583333333336 | 8.982 |
| 44939.59375 | 8.98 |
| 44939.604166666664 | 9.004 |
| 44939.614583333336 | 9.005 |
| 44939.625 | 9 |
| 44939.635416666664 | 9.006 |
| 44939.645833333336 | 9.011 |
| 44939.65625 | 9.016 |
| 44939.666666666664 | 9.028 |
| 44939.677083333336 | 9.04 |
| 44939.6875 | 9.031 |
| 44939.697916666664 | 9.048 |
| 44939.708333333336 | 9.062 |
| 44939.71875 | 9.118 |
| 44939.729166666664 | 9.122 |
| 44939.739583333336 | 9.093 |
| 44939.75 | 9.1 |
| 44939.760416666664 | 9.105 |
| 44939.770833333336 | 9.121 |
| 44939.78125 | 9.169 |
| 44939.791666666664 | 9.171 |
| 44939.802083333336 | 9.259 |
| 44939.8125 | 9.292 |
| 44939.822916666664 | 9.369 |
| 44939.833333333336 | 9.426 |
| 44939.84375 | 9.389 |
| 44939.854166666664 | 9.456 |
| 44939.864583333336 | 9.606 |
| 44939.875 | 9.759 |
| 44939.885416666664 | 9.78 |
| 44939.895833333336 | 9.75 |
| 44939.90625 | 9.647 |
| 44939.916666666664 | 9.659 |
| 44939.927083333336 | 9.648 |
| 44939.9375 | 9.671 |
| 44939.947916666664 | 9.643 |
| 44939.958333333336 | 9.608 |
| 44939.96875 | 9.571 |
| 44939.979166666664 | 9.538 |
| 44939.989583333336 | 9.553 |
| 44940.0 | 9.52 |
| 44940.010416666664 | 9.46 |
| 44940.020833333336 | 9.432 |
| 44940.03125 | 9.422 |
| 44940.041666666664 | 9.386 |
| 44940.052083333336 | 9.338 |
| 44940.0625 | 9.431 |
| 44940.072916666664 | 9.391 |
| 44940.083333333336 | 9.35 |
| 44940.09375 | 9.275 |
| 44940.104166666664 | 9.111 |
| 44940.114583333336 | 9.004 |
| 44940.125 | 8.883 |
| 44940.135416666664 | 8.767 |
| 44940.145833333336 | 8.649 |
| 44940.15625 | 8.571 |
| 44940.166666666664 | 8.516 |
| 44940.177083333336 | 8.447 |
| 44940.1875 | 8.394 |
| 44940.197916666664 | 8.357 |
| 44940.208333333336 | 8.32 |
| 44940.21875 | 8.295 |
| 44940.229166666664 | 8.287 |
| 44940.239583333336 | 8.28 |
| 44940.25 | 8.262 |
| 44940.260416666664 | 8.261 |
| 44940.270833333336 | 8.237 |
| 44940.28125 | 8.252 |
| 44940.291666666664 | 8.268 |
| 44940.302083333336 | 8.219 |
| 44940.3125 | 8.159 |
| 44940.322916666664 | 8.125 |
| 44940.333333333336 | 8.046 |
| 44940.34375 | 7.986 |
| 44940.354166666664 | 7.92 |
| 44940.364583333336 | 7.834 |
| 44940.375 | 7.822 |
| 44940.385416666664 | 7.723 |
| 44940.395833333336 | 7.633 |
| 44940.40625 | 7.565 |
| 44940.416666666664 | 7.421 |
| 44940.427083333336 | 7.32 |
| 44940.4375 | 7.288 |
| 44940.447916666664 | 7.237 |
| 44940.458333333336 | 7.243 |
| 44940.46875 | 7.424 |
| 44940.479166666664 | 7.321 |
| 44940.489583333336 | 7.28 |
| 44940.5 | 7.242 |
| 44940.510416666664 | 7.209 |
| 44940.520833333336 | 7.166 |
| 44940.53125 | 7.143 |
| 44940.541666666664 | 7.149 |
| 44940.552083333336 | 7.157 |
| 44940.5625 | 7.121 |
| 44940.572916666664 | 7.156 |
| 44940.583333333336 | 7.196 |
| 44940.59375 | 7.224 |
| 44940.604166666664 | 7.144 |
| 44940.614583333336 | 7.076 |
| 44940.625 | 7.072 |
| 44940.635416666664 | 7.045 |
| 44940.645833333336 | 7.001 |
| 44940.65625 | 6.958 |
| 44940.666666666664 | 6.94 |
| 44940.677083333336 | 6.912 |
| 44940.6875 | 6.894 |
| 44940.697916666664 | 6.888 |
| 44940.708333333336 | 6.869 |
| 44940.71875 | 6.856 |
| 44940.729166666664 | 6.858 |
| 44940.739583333336 | 6.867 |
| 44940.75 | 6.876 |
| 44940.760416666664 | 6.85 |
| 44940.770833333336 | 6.834 |
| 44940.78125 | 6.849 |
| 44940.791666666664 | 6.874 |
| 44940.802083333336 | 6.881 |
| 44940.8125 | 6.786 |
| 44940.822916666664 | 6.73 |
| 44940.833333333336 | 6.715 |
| 44940.84375 | 6.592 |
| 44940.854166666664 | 6.512 |
| 44940.864583333336 | 6.487 |
| 44940.875 | 6.435 |
| 44940.885416666664 | 6.335 |
| 44940.895833333336 | 6.246 |
| 44940.90625 | 6.144 |
| 44940.916666666664 | 6.073 |
| 44940.927083333336 | 6.026 |
| 44940.9375 | 5.946 |
| 44940.947916666664 | 5.867 |
| 44940.958333333336 | 5.851 |
| 44940.96875 | 5.8 |
| 44940.979166666664 | 5.752 |
| 44940.989583333336 | 5.689 |
| 44941.0 | 5.66 |
| 44941.010416666664 | 5.63 |
| 44941.020833333336 | 5.563 |
| 44941.03125 | 5.5 |
| 44941.041666666664 | 5.508 |
| 44941.052083333336 | 5.499 |
| 44941.0625 | 5.522 |
| 44941.072916666664 | 5.516 |
| 44941.083333333336 | 5.526 |
| 44941.09375 | 5.568 |
| 44941.104166666664 | 5.61 |
| 44941.114583333336 | 5.613 |
| 44941.125 | 5.541 |
| 44941.135416666664 | 5.473 |
| 44941.145833333336 | 5.445 |
| 44941.15625 | 5.396 |
| 44941.166666666664 | 5.348 |
| 44941.177083333336 | 5.291 |
| 44941.1875 | 5.235 |
| 44941.197916666664 | 5.205 |
| 44941.208333333336 | 5.189 |
| 44941.21875 | 5.192 |
| 44941.229166666664 | 5.183 |
| 44941.239583333336 | 5.18 |
| 44941.25 | 5.129 |
| 44941.260416666664 | 5.115 |
| 44941.270833333336 | 5.085 |
| 44941.28125 | 5.087 |
| 44941.291666666664 | 5.115 |
| 44941.302083333336 | 5.116 |
| 44941.3125 | 5.097 |
| 44941.322916666664 | 5.055 |
| 44941.333333333336 | 5.13 |
| 44941.34375 | 5.13 |
| 44941.354166666664 | 5.1 |
| 44941.364583333336 | 5.034 |
| 44941.375 | 4.969 |
| 44941.385416666664 | 4.919 |
| 44941.395833333336 | 4.799 |
| 44941.40625 | 4.7 |
| 44941.416666666664 | 4.489 |
| 44941.427083333336 | 4.305 |
| 44941.4375 | 4.317 |
| 44941.447916666664 | 4.185 |
| 44941.458333333336 | 4.065 |
| 44941.46875 | 3.84 |
| 44941.479166666664 | 3.795 |
| 44941.489583333336 | 3.556 |
| 44941.5 | 3.48 |
| 44941.510416666664 | 3.451 |
| 44941.520833333336 | 3.415 |
| 44941.53125 | 3.378 |
| 44941.541666666664 | 3.46 |
| 44941.552083333336 | 3.446 |
| 44941.5625 | 3.43 |
| 44941.572916666664 | 3.495 |
| 44941.583333333336 | 3.5 |
| 44941.59375 | 3.567 |
| 44941.604166666664 | 3.619 |
| 44941.614583333336 | 3.599 |
| 44941.625 | 3.608 |
| 44941.635416666664 | 3.643 |
| 44941.645833333336 | 3.75 |
| 44941.65625 | 3.863 |
| 44941.666666666664 | 3.904 |
| 44941.677083333336 | 3.916 |
| 44941.6875 | 3.914 |
| 44941.697916666664 | 3.952 |
| 44941.708333333336 | 4.039 |
| 44941.71875 | 4.094 |
| 44941.729166666664 | 4.127 |
| 44941.739583333336 | 4.155 |
| 44941.75 | 4.188 |
| 44941.760416666664 | 4.243 |
| 44941.770833333336 | 4.3 |
| 44941.78125 | 4.36 |
| 44941.791666666664 | 4.43 |
| 44941.802083333336 | 4.472 |
| 44941.8125 | 4.505 |
| 44941.822916666664 | 4.497 |
| 44941.833333333336 | 4.454 |
| 44941.84375 | 4.507 |
| 44941.854166666664 | 4.56 |
| 44941.864583333336 | 4.569 |
| 44941.875 | 4.637 |
| 44941.885416666664 | 4.667 |
| 44941.895833333336 | 4.709 |
| 44941.90625 | 4.778 |
| 44941.916666666664 | 4.799 |
| 44941.927083333336 | 4.766 |
| 44941.9375 | 4.791 |
| 44941.947916666664 | 4.826 |
| 44941.958333333336 | 4.902 |
| 44941.96875 | 4.852 |
| 44941.979166666664 | 4.835 |
| 44941.989583333336 | 4.81 |
| 44942.0 | 4.756 |
| 44942.010416666664 | 4.708 |
| 44942.020833333336 | 4.656 |
| 44942.03125 | 4.564 |
| 44942.041666666664 | 4.362 |
| 44942.052083333336 | 4.297 |
| 44942.0625 | 4.281 |
| 44942.072916666664 | 4.3 |
| 44942.083333333336 | 4.295 |
| 44942.09375 | 4.342 |
| 44942.104166666664 | 4.347 |
| 44942.114583333336 | 4.372 |
| 44942.125 | 4.381 |
| 44942.135416666664 | 4.405 |
| 44942.145833333336 | 4.402 |
| 44942.15625 | 4.417 |
| 44942.166666666664 | 4.402 |
| 44942.177083333336 | 4.319 |
| 44942.1875 | 4.287 |
| 44942.197916666664 | 4.303 |
| 44942.208333333336 | 4.299 |
| 44942.21875 | 4.287 |
| 44942.229166666664 | 4.272 |
| 44942.239583333336 | 4.256 |
| 44942.25 | 4.236 |
| 44942.260416666664 | 4.227 |
| 44942.270833333336 | 4.214 |
| 44942.28125 | 4.206 |
| 44942.291666666664 | 4.219 |
| 44942.302083333336 | 4.238 |
| 44942.3125 | 4.258 |
| 44942.322916666664 | 4.269 |
| 44942.333333333336 | 4.293 |
| 44942.34375 | 4.338 |
| 44942.354166666664 | 4.376 |
| 44942.364583333336 | 4.305 |
| 44942.375 | 4.362 |
| 44942.385416666664 | 4.311 |
| 44942.395833333336 | 4.321 |
| 44942.40625 | 4.201 |
| 44942.416666666664 | 4.171 |
| 44942.427083333336 | 4.018 |
| 44942.4375 | 3.972 |
| 44942.447916666664 | 3.832 |
| 44942.458333333336 | 3.775 |
| 44942.46875 | 3.687 |
| 44942.479166666664 | 3.562 |
| 44942.489583333336 | 3.351 |
| 44942.5 | 3.159 |
| 44942.510416666664 | 3.1 |
| 44942.520833333336 | 2.991 |
| 44942.53125 | 2.952 |
| 44942.541666666664 | 2.839 |
| 44942.552083333336 | 2.851 |
| 44942.5625 | 2.834 |
| 44942.572916666664 | 2.918 |
| 44942.583333333336 | 2.978 |
| 44942.59375 | 2.972 |
| 44942.604166666664 | 2.964 |
| 44942.614583333336 | 2.956 |
| 44942.625 | 2.973 |
| 44942.635416666664 | 3 |
| 44942.645833333336 | 3.073 |
| 44942.65625 | 3.14 |
| 44942.666666666664 | 3.187 |
| 44942.677083333336 | 3.249 |
| 44942.6875 | 3.333 |
| 44942.697916666664 | 3.47 |
| 44942.708333333336 | 3.664 |
| 44942.71875 | 3.967 |
| 44942.729166666664 | 4.192 |
| 44942.739583333336 | 4.187 |
| 44942.75 | 4.219 |
| 44942.760416666664 | 4.3 |
| 44942.770833333336 | 4.295 |
| 44942.78125 | 4.3 |
| 44942.791666666664 | 4.301 |
| 44942.802083333336 | 4.321 |
| 44942.8125 | 4.333 |
| 44942.822916666664 | 4.354 |
| 44942.833333333336 | 4.365 |
| 44942.84375 | 4.375 |
| 44942.854166666664 | 4.4 |
| 44942.864583333336 | 4.42 |
| 44942.875 | 4.425 |
| 44942.885416666664 | 4.405 |
| 44942.895833333336 | 4.436 |
| 44942.90625 | 4.523 |
| 44942.916666666664 | 4.589 |
| 44942.927083333336 | 4.645 |
| 44942.9375 | 4.669 |
| 44942.947916666664 | 4.685 |
| 44942.958333333336 | 4.66 |
| 44942.96875 | 4.684 |
| 44942.979166666664 | 4.695 |
| 44942.989583333336 | 4.767 |
| 44943.0 | 4.775 |
| 44943.010416666664 | 4.869 |
| 44943.020833333336 | 4.939 |
| 44943.03125 | 4.877 |
| 44943.041666666664 | 4.742 |
| 44943.052083333336 | 4.512 |
| 44943.0625 | 4.471 |
| 44943.072916666664 | 4.456 |
| 44943.083333333336 | 4.438 |
| 44943.09375 | 4.435 |
| 44943.104166666664 | 4.443 |
| 44943.114583333336 | 4.426 |
| 44943.125 | 4.479 |
| 44943.135416666664 | 4.467 |
| 44943.145833333336 | 4.47 |
| 44943.15625 | 4.472 |
| 44943.166666666664 | 4.51 |
| 44943.177083333336 | 4.536 |
| 44943.1875 | 4.557 |
| 44943.197916666664 | 4.59 |
| 44943.208333333336 | 4.639 |
| 44943.21875 | 4.64 |
| 44943.229166666664 | 4.611 |
| 44943.239583333336 | 4.6 |
| 44943.25 | 4.591 |
| 44943.260416666664 | 4.572 |
| 44943.270833333336 | 4.557 |
| 44943.28125 | 4.542 |
| 44943.291666666664 | 4.543 |
| 44943.302083333336 | 4.563 |
| 44943.3125 | 4.586 |
| 44943.322916666664 | 4.595 |
| 44943.333333333336 | 4.604 |
| 44943.34375 | 4.606 |
| 44943.354166666664 | 4.615 |
| 44943.364583333336 | 4.623 |
| 44943.375 | 4.645 |
| 44943.385416666664 | 4.664 |
| 44943.395833333336 | 4.66 |
| 44943.40625 | 4.645 |
| 44943.416666666664 | 4.63 |
| 44943.427083333336 | 4.622 |
| 44943.4375 | 4.569 |
| 44943.447916666664 | 4.527 |
| 44943.458333333336 | 4.509 |
| 44943.46875 | 4.405 |
| 44943.479166666664 | 4.359 |
| 44943.489583333336 | 4.242 |
| 44943.5 | 4.148 |
| 44943.510416666664 | 4.062 |
| 44943.520833333336 | 4.076 |
| 44943.53125 | 4.011 |
| 44943.541666666664 | 4.016 |
| 44943.552083333336 | 4.025 |
| 44943.5625 | 4.016 |
| 44943.572916666664 | 4.016 |
| 44943.583333333336 | 4.028 |
| 44943.59375 | 4.043 |
| 44943.604166666664 | 4.07 |
| 44943.614583333336 | 4.101 |
| 44943.625 | 4.107 |
| 44943.635416666664 | 4.119 |
| 44943.645833333336 | 4.135 |
| 44943.65625 | 4.155 |
| 44943.666666666664 | 4.162 |
| 44943.677083333336 | 4.22 |
| 44943.6875 | 4.216 |
| 44943.697916666664 | 4.22 |
| 44943.708333333336 | 4.21 |
| 44943.71875 | 4.222 |
| 44943.729166666664 | 4.246 |
| 44943.739583333336 | 4.298 |
| 44943.75 | 4.403 |
| 44943.760416666664 | 4.591 |
| 44943.770833333336 | 4.742 |
| 44943.78125 | 4.826 |
| 44943.791666666664 | 4.86 |
| 44943.802083333336 | 4.888 |
| 44943.8125 | 4.911 |
| 44943.822916666664 | 4.936 |
| 44943.833333333336 | 4.926 |
| 44943.84375 | 4.926 |
| 44943.854166666664 | 4.936 |
| 44943.864583333336 | 4.94 |
| 44943.875 | 4.953 |
| 44943.885416666664 | 4.959 |
| 44943.895833333336 | 4.97 |
| 44943.90625 | 4.966 |
| 44943.916666666664 | 4.977 |
| 44943.927083333336 | 4.98 |
| 44943.9375 | 5.028 |
| 44943.947916666664 | 5.071 |
| 44943.958333333336 | 5.101 |
| 44943.96875 | 5.168 |
| 44943.979166666664 | 5.208 |
| 44943.989583333336 | 5.169 |
| 44944.0 | 5.179 |
| 44944.010416666664 | 5.165 |
| 44944.020833333336 | 5.256 |
| 44944.03125 | 5.309 |
| 44944.041666666664 | 5.211 |
| 44944.052083333336 | 5.207 |
| 44944.0625 | 5.178 |
| 44944.072916666664 | 5.178 |
| 44944.083333333336 | 5.176 |
| 44944.09375 | 5.174 |
| 44944.104166666664 | 5.165 |
| 44944.114583333336 | 5.155 |
| 44944.125 | 5.144 |
| 44944.135416666664 | 5.144 |
| 44944.145833333336 | 5.152 |
| 44944.15625 | 5.153 |
| 44944.166666666664 | 5.166 |
| 44944.177083333336 | 5.181 |
| 44944.1875 | 5.202 |
| 44944.197916666664 | 5.219 |
| 44944.208333333336 | 5.235 |
| 44944.21875 | 5.233 |
| 44944.229166666664 | 5.245 |
| 44944.239583333336 | 5.253 |
| 44944.25 | 5.251 |
| 44944.260416666664 | 5.258 |
| 44944.270833333336 | 5.272 |
| 44944.28125 | 5.278 |
| 44944.291666666664 | 5.276 |
| 44944.302083333336 | 5.28 |
| 44944.3125 | 5.275 |
| 44944.322916666664 | 5.277 |
| 44944.333333333336 | 5.276 |
| 44944.34375 | 5.274 |
| 44944.354166666664 | 5.274 |
| 44944.364583333336 | 5.277 |
| 44944.375 | 5.277 |
| 44944.385416666664 | 5.265 |
| 44944.395833333336 | 5.253 |
| 44944.40625 | 5.23 |
| 44944.416666666664 | 5.231 |
| 44944.427083333336 | 5.227 |
| 44944.4375 | 5.282 |
| 44944.447916666664 | 5.263 |
| 44944.458333333336 | 5.25 |
| 44944.46875 | 5.256 |
| 44944.479166666664 | 5.264 |
| 44944.489583333336 | 5.265 |
| 44944.5 | 5.284 |
| 44944.510416666664 | 5.285 |
| 44944.520833333336 | 5.299 |
| 44944.53125 | 5.293 |
| 44944.541666666664 | 5.327 |
| 44944.552083333336 | 5.358 |
| 44944.5625 | 5.398 |
| 44944.572916666664 | 5.436 |
| 44944.583333333336 | 5.503 |
| 44944.59375 | 5.491 |
| 44944.604166666664 | 5.519 |
| 44944.614583333336 | 5.567 |
| 44944.625 | 5.613 |
| 44944.635416666664 | 5.697 |
| 44944.645833333336 | 5.738 |
| 44944.65625 | 5.825 |
| 44944.666666666664 | 5.919 |
| 44944.677083333336 | 6.007 |
| 44944.6875 | 6.071 |
| 44944.697916666664 | 6.111 |
| 44944.708333333336 | 6.18 |
| 44944.71875 | 6.268 |
| 44944.729166666664 | 6.15 |
| 44944.739583333336 | 6.162 |
| 44944.75 | 6.195 |
| 44944.760416666664 | 6.305 |
| 44944.770833333336 | 6.482 |
| 44944.78125 | 6.63 |
| 44944.791666666664 | 6.837 |
| 44944.802083333336 | 6.974 |
| 44944.8125 | 7.081 |
| 44944.822916666664 | 7.199 |
| 44944.833333333336 | 7.366 |
| 44944.84375 | 7.487 |
| 44944.854166666664 | 7.584 |
| 44944.864583333336 | 7.63 |
| 44944.875 | 7.629 |
| 44944.885416666664 | 7.641 |
| 44944.895833333336 | 7.632 |
| 44944.90625 | 7.61 |
| 44944.916666666664 | 7.54 |
| 44944.927083333336 | 7.495 |
| 44944.9375 | 7.459 |
| 44944.947916666664 | 7.352 |
| 44944.958333333336 | 7.416 |
| 44944.96875 | 7.412 |
| 44944.979166666664 | 7.497 |
| 44944.989583333336 | 7.515 |
| 44945.0 | 7.586 |
| 44945.010416666664 | 7.595 |
| 44945.020833333336 | 7.626 |
| 44945.03125 | 7.706 |
| 44945.041666666664 | 7.77 |
| 44945.052083333336 | 7.747 |
| 44945.0625 | 7.633 |
| 44945.072916666664 | 7.483 |
| 44945.083333333336 | 7.405 |
| 44945.09375 | 7.352 |
| 44945.104166666664 | 7.33 |
| 44945.114583333336 | 7.297 |
| 44945.125 | 7.285 |
| 44945.135416666664 | 7.301 |
| 44945.145833333336 | 7.282 |
| 44945.15625 | 7.293 |
| 44945.166666666664 | 7.307 |
| 44945.177083333336 | 7.308 |
| 44945.1875 | 7.261 |
| 44945.197916666664 | 7.24 |
| 44945.208333333336 | 7.24 |
| 44945.21875 | 7.247 |
| 44945.229166666664 | 7.248 |
| 44945.239583333336 | 7.273 |
| 44945.25 | 7.293 |
| 44945.260416666664 | 7.289 |
| 44945.270833333336 | 7.27 |
| 44945.28125 | 7.245 |
| 44945.291666666664 | 7.216 |
| 44945.302083333336 | 7.202 |
| 44945.3125 | 7.16 |
| 44945.322916666664 | 7.082 |
| 44945.333333333336 | 7.018 |
| 44945.34375 | 6.964 |
| 44945.354166666664 | 6.845 |
| 44945.364583333336 | 6.668 |
| 44945.375 | 6.54 |
| 44945.385416666664 | 6.476 |
| 44945.395833333336 | 6.417 |
| 44945.40625 | 6.405 |
| 44945.416666666664 | 6.412 |
| 44945.427083333336 | 6.452 |
| 44945.4375 | 6.485 |
| 44945.447916666664 | 6.517 |
| 44945.458333333336 | 6.524 |
| 44945.46875 | 6.528 |
| 44945.479166666664 | 6.566 |
| 44945.489583333336 | 6.557 |
| 44945.5 | 6.539 |
| 44945.510416666664 | 6.527 |
| 44945.520833333336 | 6.428 |
| 44945.53125 | 6.507 |
| 44945.541666666664 | 6.453 |
| 44945.552083333336 | 6.457 |
| 44945.5625 | 6.5 |
| 44945.572916666664 | 6.545 |
| 44945.583333333336 | 6.587 |
| 44945.59375 | 6.643 |
| 44945.604166666664 | 6.728 |
| 44945.614583333336 | 6.85 |
| 44945.625 | 6.901 |
| 44945.635416666664 | 6.974 |
| 44945.645833333336 | 7.062 |
| 44945.65625 | 7.162 |
| 44945.666666666664 | 7.255 |
| 44945.677083333336 | 7.329 |
| 44945.6875 | 7.379 |
| 44945.697916666664 | 7.48 |
| 44945.708333333336 | 7.531 |
| 44945.71875 | 7.65 |
| 44945.729166666664 | 7.712 |
| 44945.739583333336 | 7.722 |
| 44945.75 | 7.757 |
| 44945.760416666664 | 7.672 |
| 44945.770833333336 | 7.662 |
| 44945.78125 | 7.668 |
| 44945.791666666664 | 7.711 |
| 44945.802083333336 | 7.716 |
| 44945.8125 | 7.746 |
| 44945.822916666664 | 7.799 |
| 44945.833333333336 | 7.846 |
| 44945.84375 | 7.868 |
| 44945.854166666664 | 7.891 |
| 44945.864583333336 | 7.896 |
| 44945.875 | 7.906 |
| 44945.885416666664 | 7.914 |
| 44945.895833333336 | 7.927 |
| 44945.90625 | 7.924 |
| 44945.916666666664 | 7.904 |
| 44945.927083333336 | 7.851 |
| 44945.9375 | 7.782 |
| 44945.947916666664 | 7.763 |
| 44945.958333333336 | 7.742 |
| 44945.96875 | 7.735 |
| 44945.979166666664 | 7.784 |
| 44945.989583333336 | 7.786 |
| 44946.0 | 7.805 |
| 44946.010416666664 | 7.895 |
| 44946.020833333336 | 8.032 |
| 44946.03125 | 8.141 |
| 44946.041666666664 | 8.115 |
| 44946.052083333336 | 8.163 |
| 44946.0625 | 8.165 |
| 44946.072916666664 | 8.432 |
| 44946.083333333336 | 8.36 |
| 44946.09375 | 8.439 |
| 44946.104166666664 | 8.655 |
| 44946.114583333336 | 8.685 |
| 44946.125 | 8.671 |
| 44946.135416666664 | 8.677 |
| 44946.145833333336 | 8.678 |
| 44946.15625 | 8.686 |
| 44946.166666666664 | 8.696 |
| 44946.177083333336 | 8.716 |
| 44946.1875 | 8.743 |
| 44946.197916666664 | 8.798 |
| 44946.208333333336 | 8.832 |
| 44946.21875 | 8.87 |
| 44946.229166666664 | 8.858 |
| 44946.239583333336 | 8.837 |
| 44946.25 | 8.796 |
| 44946.260416666664 | 8.769 |
| 44946.270833333336 | 8.737 |
| 44946.28125 | 8.717 |
| 44946.291666666664 | 8.696 |
| 44946.302083333336 | 8.581 |
| 44946.3125 | 8.518 |
| 44946.322916666664 | 8.502 |
| 44946.333333333336 | 8.46 |
| 44946.34375 | 8.403 |
| 44946.354166666664 | 8.315 |
| 44946.364583333336 | 8.248 |
| 44946.375 | 8.166 |
| 44946.385416666664 | 8.063 |
| 44946.395833333336 | 7.9 |
| 44946.40625 | 7.717 |
| 44946.416666666664 | 7.628 |
| 44946.427083333336 | 7.589 |
| 44946.4375 | 7.61 |
| 44946.447916666664 | 7.645 |
| 44946.458333333336 | 7.697 |
| 44946.46875 | 7.727 |
| 44946.479166666664 | 7.731 |
| 44946.489583333336 | 7.719 |
| 44946.5 | 7.698 |
| 44946.510416666664 | 7.686 |
| 44946.520833333336 | 7.674 |
| 44946.53125 | 7.695 |
| 44946.541666666664 | 7.7 |
| 44946.552083333336 | 7.687 |
| 44946.5625 | 7.696 |
| 44946.572916666664 | 7.681 |
| 44946.583333333336 | 7.669 |
| 44946.59375 | 7.656 |
| 44946.604166666664 | 7.698 |
| 44946.614583333336 | 7.751 |
| 44946.625 | 7.821 |
| 44946.635416666664 | 7.961 |
| 44946.645833333336 | 8.188 |
| 44946.65625 | 8.288 |
| 44946.666666666664 | 8.538 |
| 44946.677083333336 | 8.706 |
| 44946.6875 | 8.863 |
| 44946.697916666664 | 8.984 |
| 44946.708333333336 | 9.12 |
| 44946.71875 | 9.312 |
| 44946.729166666664 | 9.323 |
| 44946.739583333336 | 9.433 |
| 44946.75 | 9.479 |
| 44946.760416666664 | 9.502 |
| 44946.770833333336 | 9.602 |
| 44946.78125 | 9.582 |
| 44946.791666666664 | 9.582 |
| 44946.802083333336 | 9.491 |
| 44946.8125 | 9.446 |
| 44946.822916666664 | 9.415 |
| 44946.833333333336 | 9.363 |
| 44946.84375 | 9.209 |
| 44946.854166666664 | 9.093 |
| 44946.864583333336 | 9.176 |
| 44946.875 | 9.224 |
| 44946.885416666664 | 9.228 |
| 44946.895833333336 | 9.228 |
| 44946.90625 | 9.192 |
| 44946.916666666664 | 9.168 |
| 44946.927083333336 | 9.121 |
| 44946.9375 | 9.043 |
| 44946.947916666664 | 8.939 |
| 44946.958333333336 | 8.836 |
| 44946.96875 | 8.687 |
| 44946.979166666664 | 8.578 |
| 44946.989583333336 | 8.505 |
| 44947.0 | 8.495 |
| 44947.010416666664 | 8.558 |
| 44947.020833333336 | 8.501 |
| 44947.03125 | 8.436 |
| 44947.041666666664 | 8.344 |
| 44947.052083333336 | 8.359 |
| 44947.0625 | 8.357 |
| 44947.072916666664 | 8.327 |
| 44947.083333333336 | 8.33 |
| 44947.09375 | 8.341 |
| 44947.104166666664 | 8.234 |
| 44947.114583333336 | 8.195 |
| 44947.125 | 8.169 |
| 44947.135416666664 | 8.106 |
| 44947.145833333336 | 8.074 |
| 44947.15625 | 8.037 |
| 44947.166666666664 | 8.112 |
| 44947.177083333336 | 8.214 |
| 44947.1875 | 8.221 |
| 44947.197916666664 | 8.148 |
| 44947.208333333336 | 8.106 |
| 44947.21875 | 8.051 |
| 44947.229166666664 | 8.012 |
| 44947.239583333336 | 7.96 |
| 44947.25 | 7.909 |
| 44947.260416666664 | 7.889 |
| 44947.270833333336 | 7.901 |
| 44947.28125 | 7.825 |
| 44947.291666666664 | 7.815 |
| 44947.302083333336 | 7.869 |
| 44947.3125 | 7.872 |
| 44947.322916666664 | 7.89 |
| 44947.333333333336 | 7.79 |
| 44947.34375 | 7.633 |
| 44947.354166666664 | 7.463 |
| 44947.364583333336 | 7.307 |
| 44947.375 | 7.112 |
| 44947.385416666664 | 6.912 |
| 44947.395833333336 | 6.777 |
| 44947.40625 | 6.614 |
| 44947.416666666664 | 6.522 |
| 44947.427083333336 | 6.519 |
| 44947.4375 | 6.636 |
| 44947.447916666664 | 6.692 |
| 44947.458333333336 | 6.715 |
| 44947.46875 | 6.735 |
| 44947.479166666664 | 6.778 |
| 44947.489583333336 | 6.877 |
| 44947.5 | 6.92 |
| 44947.510416666664 | 6.961 |
| 44947.520833333336 | 6.965 |
| 44947.53125 | 6.951 |
| 44947.541666666664 | 6.938 |
| 44947.552083333336 | 6.931 |
| 44947.5625 | 6.908 |
| 44947.572916666664 | 6.887 |
| 44947.583333333336 | 6.886 |
| 44947.59375 | 6.815 |
| 44947.604166666664 | 6.716 |
| 44947.614583333336 | 6.608 |
| 44947.625 | 6.569 |
| 44947.635416666664 | 6.554 |
| 44947.645833333336 | 6.557 |
| 44947.65625 | 6.643 |
| 44947.666666666664 | 6.596 |
| 44947.677083333336 | 6.737 |
| 44947.6875 | 6.927 |
| 44947.697916666664 | 6.938 |
| 44947.708333333336 | 6.992 |
| 44947.71875 | 7.189 |
| 44947.729166666664 | 7.373 |
| 44947.739583333336 | 7.527 |
| 44947.75 | 7.601 |
| 44947.760416666664 | 7.561 |
| 44947.770833333336 | 7.699 |
| 44947.78125 | 7.728 |
| 44947.791666666664 | 7.721 |
| 44947.802083333336 | 7.732 |
| 44947.8125 | 7.751 |
| 44947.822916666664 | 7.816 |
| 44947.833333333336 | 7.761 |
| 44947.84375 | 7.698 |
| 44947.854166666664 | 7.652 |
| 44947.864583333336 | 7.611 |
| 44947.875 | 7.622 |
| 44947.885416666664 | 7.579 |
| 44947.895833333336 | 7.582 |
| 44947.90625 | 7.626 |
| 44947.916666666664 | 7.651 |
| 44947.927083333336 | 7.616 |
| 44947.9375 | 7.591 |
| 44947.947916666664 | 7.637 |
| 44947.958333333336 | 7.687 |
| 44947.96875 | 7.677 |
| 44947.979166666664 | 7.587 |
| 44947.989583333336 | 7.537 |
| 44948.0 | 7.498 |
| 44948.010416666664 | 7.469 |
| 44948.020833333336 | 7.456 |
| 44948.03125 | 7.446 |
| 44948.041666666664 | 7.444 |
| 44948.052083333336 | 7.43 |
| 44948.0625 | 7.479 |
| 44948.072916666664 | 7.473 |
| 44948.083333333336 | 7.418 |
| 44948.09375 | 7.371 |
| 44948.104166666664 | 7.344 |
| 44948.114583333336 | 7.324 |
| 44948.125 | 7.289 |
| 44948.135416666664 | 7.234 |
| 44948.145833333336 | 7.191 |
| 44948.15625 | 7.135 |
| 44948.166666666664 | 7.031 |
| 44948.177083333336 | 6.955 |
| 44948.1875 | 6.899 |
| 44948.197916666664 | 6.88 |
| 44948.208333333336 | 6.83 |
| 44948.21875 | 6.853 |
| 44948.229166666664 | 6.885 |
| 44948.239583333336 | 6.892 |
| 44948.25 | 6.904 |
| 44948.260416666664 | 6.912 |
| 44948.270833333336 | 6.906 |
| 44948.28125 | 6.888 |
| 44948.291666666664 | 6.883 |
| 44948.302083333336 | 6.887 |
| 44948.3125 | 6.888 |
| 44948.322916666664 | 6.882 |
| 44948.333333333336 | 6.825 |
| 44948.34375 | 6.878 |
| 44948.354166666664 | 6.876 |
| 44948.364583333336 | 6.845 |
| 44948.375 | 6.788 |
| 44948.385416666664 | 6.752 |
| 44948.395833333336 | 6.704 |
| 44948.40625 | 6.655 |
| 44948.416666666664 | 6.62 |
| 44948.427083333336 | 6.592 |
| 44948.4375 | 6.586 |
| 44948.447916666664 | 6.584 |
| 44948.458333333336 | 6.593 |
| 44948.46875 | 6.629 |
| 44948.479166666664 | 6.637 |
| 44948.489583333336 | 6.637 |
| 44948.5 | 6.635 |
| 44948.510416666664 | 6.644 |
| 44948.520833333336 | 6.666 |
| 44948.53125 | 6.677 |
| 44948.541666666664 | 6.685 |
| 44948.552083333336 | 6.687 |
| 44948.5625 | 6.685 |
| 44948.572916666664 | 6.682 |
| 44948.583333333336 | 6.683 |
| 44948.59375 | 6.682 |
| 44948.604166666664 | 6.688 |
| 44948.614583333336 | 6.69 |
| 44948.625 | 6.656 |
| 44948.635416666664 | 6.684 |
| 44948.645833333336 | 6.649 |
| 44948.65625 | 6.613 |
| 44948.666666666664 | 6.553 |
| 44948.677083333336 | 6.524 |
| 44948.6875 | 6.476 |
| 44948.697916666664 | 6.433 |
| 44948.708333333336 | 6.418 |
| 44948.71875 | 6.413 |
| 44948.729166666664 | 6.42 |
| 44948.739583333336 | 6.416 |
| 44948.75 | 6.414 |
| 44948.760416666664 | 6.431 |
| 44948.770833333336 | 6.46 |
| 44948.78125 | 6.495 |
| 44948.791666666664 | 6.531 |
| 44948.802083333336 | 6.549 |
| 44948.8125 | 6.568 |
| 44948.822916666664 | 6.57 |
| 44948.833333333336 | 6.576 |
| 44948.84375 | 6.565 |
| 44948.854166666664 | 6.563 |
| 44948.864583333336 | 6.579 |
| 44948.875 | 6.596 |
| 44948.885416666664 | 6.591 |
| 44948.895833333336 | 6.597 |
| 44948.90625 | 6.613 |
| 44948.916666666664 | 6.626 |
| 44948.927083333336 | 6.637 |
| 44948.9375 | 6.68 |
| 44948.947916666664 | 6.711 |
| 44948.958333333336 | 6.73 |
| 44948.96875 | 6.761 |
| 44948.979166666664 | 6.787 |
| 44948.989583333336 | 6.821 |
| 44949.0 | 6.845 |
| 44949.010416666664 | 6.837 |
| 44949.020833333336 | 6.845 |
| 44949.03125 | 6.852 |
| 44949.041666666664 | 6.858 |
| 44949.052083333336 | 6.862 |
| 44949.0625 | 6.86 |
| 44949.072916666664 | 6.854 |
| 44949.083333333336 | 6.857 |
| 44949.09375 | 6.862 |
| 44949.104166666664 | 6.868 |
| 44949.114583333336 | 6.953 |
| 44949.125 | 6.945 |
| 44949.135416666664 | 6.931 |
| 44949.145833333336 | 6.969 |
| 44949.15625 | 6.964 |
| 44949.166666666664 | 7.054 |
| 44949.177083333336 | 7.029 |
| 44949.1875 | 7.104 |
| 44949.197916666664 | 7.141 |
| 44949.208333333336 | 7.156 |
| 44949.21875 | 7.196 |
| 44949.229166666664 | 7.215 |
| 44949.239583333336 | 7.245 |
| 44949.25 | 7.26 |
| 44949.260416666664 | 7.275 |
| 44949.270833333336 | 7.271 |
| 44949.28125 | 7.257 |
| 44949.291666666664 | 7.234 |
| 44949.302083333336 | 7.218 |
| 44949.3125 | 7.2 |
| 44949.322916666664 | 7.195 |
| 44949.333333333336 | 7.181 |
| 44949.34375 | 7.185 |
| 44949.354166666664 | 7.181 |
| 44949.364583333336 | 7.179 |
| 44949.375 | 7.18 |
| 44949.385416666664 | 7.174 |
| 44949.395833333336 | 7.173 |
| 44949.40625 | 7.171 |
| 44949.416666666664 | 7.167 |
| 44949.427083333336 | 7.148 |
| 44949.4375 | 7.131 |
| 44949.447916666664 | 7.11 |
| 44949.458333333336 | 7.099 |
| 44949.46875 | 7.08 |
| 44949.479166666664 | 7.061 |
| 44949.489583333336 | 7.025 |
| 44949.5 | 6.998 |
| 44949.510416666664 | 6.965 |
| 44949.520833333336 | 6.94 |
| 44949.53125 | 6.931 |
| 44949.541666666664 | 6.93 |
| 44949.552083333336 | 6.937 |
| 44949.5625 | 6.945 |
| 44949.572916666664 | 6.95 |
| 44949.583333333336 | 6.955 |
| 44949.59375 | 6.958 |
| 44949.604166666664 | 6.964 |
| 44949.614583333336 | 6.976 |
| 44949.625 | 6.991 |
| 44949.635416666664 | 7.028 |
| 44949.645833333336 | 7.047 |
| 44949.65625 | 7.087 |
| 44949.666666666664 | 7.143 |
| 44949.677083333336 | 7.172 |
| 44949.6875 | 7.248 |
| 44949.697916666664 | 7.326 |
| 44949.708333333336 | 7.406 |
| 44949.71875 | 7.475 |
| 44949.729166666664 | 7.583 |
| 44949.739583333336 | 7.763 |
| 44949.75 | 7.777 |
| 44949.760416666664 | 8.025 |
| 44949.770833333336 | 8.178 |
| 44949.78125 | 8.278 |
| 44949.791666666664 | 8.472 |
| 44949.802083333336 | 8.675 |
| 44949.8125 | 8.782 |
| 44949.822916666664 | 8.857 |
| 44949.833333333336 | 8.817 |
| 44949.84375 | 8.728 |
| 44949.854166666664 | 8.76 |
| 44949.864583333336 | 8.791 |
| 44949.875 | 8.789 |
| 44949.885416666664 | 8.79 |
| 44949.895833333336 | 8.735 |
| 44949.90625 | 8.652 |
| 44949.916666666664 | 8.629 |
| 44949.927083333336 | 8.559 |
| 44949.9375 | 8.447 |
| 44949.947916666664 | 8.338 |
| 44949.958333333336 | 8.231 |
| 44949.96875 | 8.129 |
| 44949.979166666664 | 8.007 |
| 44949.989583333336 | 7.912 |
| 44950.0 | 7.795 |
| 44950.010416666664 | 7.745 |
| 44950.020833333336 | 7.683 |
| 44950.03125 | 7.626 |
| 44950.041666666664 | 7.595 |
| 44950.052083333336 | 7.537 |
| 44950.0625 | 7.487 |
| 44950.072916666664 | 7.445 |
| 44950.083333333336 | 7.403 |
| 44950.09375 | 7.364 |
| 44950.104166666664 | 7.34 |
| 44950.114583333336 | 7.319 |
| 44950.125 | 7.303 |
| 44950.135416666664 | 7.271 |
| 44950.145833333336 | 7.314 |
| 44950.15625 | 7.2 |
| 44950.166666666664 | 7.059 |
| 44950.177083333336 | 6.911 |
| 44950.1875 | 6.78 |
| 44950.197916666664 | 6.677 |
| 44950.208333333336 | 6.571 |
| 44950.21875 | 6.577 |
| 44950.229166666664 | 6.438 |
| 44950.239583333336 | 6.432 |
| 44950.25 | 6.362 |
| 44950.260416666664 | 6.55 |
| 44950.270833333336 | 6.637 |
| 44950.28125 | 6.602 |
| 44950.291666666664 | 6.53 |
| 44950.302083333336 | 6.485 |
| 44950.3125 | 6.481 |
| 44950.322916666664 | 6.465 |
| 44950.333333333336 | 6.454 |
| 44950.34375 | 6.405 |
| 44950.354166666664 | 6.346 |
| 44950.364583333336 | 6.286 |
| 44950.375 | 6.243 |
| 44950.385416666664 | 6.25 |
| 44950.395833333336 | 6.225 |
| 44950.40625 | 6.204 |
| 44950.416666666664 | 6.261 |
| 44950.427083333336 | 6.319 |
| 44950.4375 | 6.314 |
| 44950.447916666664 | 6.269 |
| 44950.458333333336 | 6.234 |
| 44950.46875 | 6.056 |
| 44950.479166666664 | 5.904 |
| 44950.489583333336 | 5.79 |
| 44950.5 | 5.705 |
| 44950.510416666664 | 5.659 |
| 44950.520833333336 | 5.645 |
| 44950.53125 | 5.662 |
| 44950.541666666664 | 5.731 |
| 44950.552083333336 | 5.873 |
| 44950.5625 | 5.96 |
| 44950.572916666664 | 6.042 |
| 44950.583333333336 | 6.098 |
| 44950.59375 | 6.138 |
| 44950.604166666664 | 6.17 |
| 44950.614583333336 | 6.2 |
| 44950.625 | 6.257 |
| 44950.635416666664 | 6.317 |
| 44950.645833333336 | 6.346 |
| 44950.65625 | 6.407 |
| 44950.666666666664 | 6.367 |
| 44950.677083333336 | 6.482 |
| 44950.6875 | 6.577 |
| 44950.697916666664 | 6.635 |
| 44950.708333333336 | 6.722 |
| 44950.71875 | 6.804 |
| 44950.729166666664 | 6.934 |
| 44950.739583333336 | 7.017 |
| 44950.75 | 7.102 |
| 44950.760416666664 | 7.263 |
| 44950.770833333336 | 7.416 |
| 44950.78125 | 7.382 |
| 44950.791666666664 | 7.562 |
| 44950.802083333336 | 7.723 |
| 44950.8125 | 7.862 |
| 44950.822916666664 | 7.798 |
| 44950.833333333336 | 7.75 |
| 44950.84375 | 7.845 |
| 44950.854166666664 | 7.837 |
| 44950.864583333336 | 7.848 |
| 44950.875 | 7.855 |
| 44950.885416666664 | 7.867 |
| 44950.895833333336 | 7.879 |
| 44950.90625 | 7.899 |
| 44950.916666666664 | 7.926 |
| 44950.927083333336 | 7.807 |
| 44950.9375 | 7.753 |
| 44950.947916666664 | 7.749 |
| 44950.958333333336 | 7.706 |
| 44950.96875 | 7.643 |
| 44950.979166666664 | 7.592 |
| 44950.989583333336 | 7.543 |
| 44951.0 | 7.449 |
| 44951.010416666664 | 7.334 |
| 44951.020833333336 | 7.25 |
| 44951.03125 | 7.185 |
| 44951.041666666664 | 7.126 |
| 44951.052083333336 | 7.065 |
| 44951.0625 | 7.048 |
| 44951.072916666664 | 7.065 |
| 44951.083333333336 | 7.085 |
| 44951.09375 | 7.11 |
| 44951.104166666664 | 7.114 |
| 44951.114583333336 | 7.115 |
| 44951.125 | 7.122 |
| 44951.135416666664 | 7.124 |
| 44951.145833333336 | 7.128 |
| 44951.15625 | 7.122 |
| 44951.166666666664 | 7.109 |
| 44951.177083333336 | 7.101 |
| 44951.1875 | 6.999 |
| 44951.197916666664 | 6.884 |
| 44951.208333333336 | 6.698 |
| 44951.21875 | 6.508 |
| 44951.229166666664 | 6.35 |
| 44951.239583333336 | 6.066 |
| 44951.25 | 6.001 |
| 44951.260416666664 | 5.969 |
| 44951.270833333336 | 5.942 |
| 44951.28125 | 5.878 |
| 44951.291666666664 | 5.996 |
| 44951.302083333336 | 6.176 |
| 44951.3125 | 6.143 |
| 44951.322916666664 | 6.189 |
| 44951.333333333336 | 6.222 |
| 44951.34375 | 6.075 |
| 44951.354166666664 | 6.096 |
| 44951.364583333336 | 6.087 |
| 44951.375 | 6.08 |
| 44951.385416666664 | 6.083 |
| 44951.395833333336 | 6.098 |
| 44951.40625 | 6.079 |
| 44951.416666666664 | 6.113 |
| 44951.427083333336 | 6.117 |
| 44951.4375 | 6.091 |
| 44951.447916666664 | 6.084 |
| 44951.458333333336 | 6.135 |
| 44951.46875 | 6.149 |
| 44951.479166666664 | 6.159 |
| 44951.489583333336 | 6.144 |
| 44951.5 | 6.119 |
| 44951.510416666664 | 6.078 |
| 44951.520833333336 | 6.009 |
| 44951.53125 | 5.984 |
| 44951.541666666664 | 5.997 |
| 44951.552083333336 | 6.05 |
| 44951.5625 | 6.111 |
| 44951.572916666664 | 6.211 |
| 44951.583333333336 | 6.324 |
| 44951.59375 | 6.432 |
| 44951.604166666664 | 6.539 |
| 44951.614583333336 | 6.639 |
| 44951.625 | 6.676 |
| 44951.635416666664 | 6.717 |
| 44951.645833333336 | 6.699 |
| 44951.65625 | 6.717 |
| 44951.666666666664 | 6.732 |
| 44951.677083333336 | 6.751 |
| 44951.6875 | 6.77 |
| 44951.697916666664 | 6.791 |
| 44951.708333333336 | 6.694 |
| 44951.71875 | 6.811 |
| 44951.729166666664 | 6.825 |
| 44951.739583333336 | 6.845 |
| 44951.75 | 6.872 |
| 44951.760416666664 | 6.902 |
| 44951.770833333336 | 6.907 |
| 44951.78125 | 6.925 |
| 44951.791666666664 | 6.966 |
| 44951.802083333336 | 6.992 |
| 44951.8125 | 6.998 |
| 44951.822916666664 | 7.046 |
| 44951.833333333336 | 7.024 |
| 44951.84375 | 7.026 |
| 44951.854166666664 | 6.995 |
| 44951.864583333336 | 6.96 |
| 44951.875 | 6.97 |
| 44951.885416666664 | 6.968 |
| 44951.895833333336 | 6.935 |
| 44951.90625 | 7.01 |
| 44951.916666666664 | 7.035 |
| 44951.927083333336 | 7.024 |
| 44951.9375 | 7.012 |
| 44951.947916666664 | 7.076 |
| 44951.958333333336 | 7.073 |
| 44951.96875 | 7.039 |
| 44951.979166666664 | 7.022 |
| 44951.989583333336 | 7.031 |
| 44952.0 | 7.152 |
| 44952.010416666664 | 7.256 |
| 44952.020833333336 | 7.336 |
| 44952.03125 | 7.443 |
| 44952.041666666664 | 7.519 |
| 44952.052083333336 | 7.577 |
| 44952.0625 | 7.621 |
| 44952.072916666664 | 7.668 |
| 44952.083333333336 | 7.705 |
| 44952.09375 | 7.744 |
| 44952.104166666664 | 7.785 |
| 44952.114583333336 | 7.824 |
| 44952.125 | 7.857 |
| 44952.135416666664 | 7.877 |
| 44952.145833333336 | 7.893 |
| 44952.15625 | 7.881 |
| 44952.166666666664 | 7.897 |
| 44952.177083333336 | 7.89 |
| 44952.1875 | 7.885 |
| 44952.197916666664 | 7.917 |
| 44952.208333333336 | 7.855 |
| 44952.21875 | 7.828 |
| 44952.229166666664 | 7.833 |
| 44952.239583333336 | 7.958 |
| 44952.25 | 7.964 |
| 44952.260416666664 | 8.059 |
| 44952.270833333336 | 8.258 |
| 44952.28125 | 8.307 |
| 44952.291666666664 | 8.461 |
| 44952.302083333336 | 8.428 |
| 44952.3125 | 8.547 |
| 44952.322916666664 | 8.564 |
| 44952.333333333336 | 8.573 |
| 44952.34375 | 8.678 |
| 44952.354166666664 | 8.672 |
| 44952.364583333336 | 8.679 |
| 44952.375 | 8.668 |
| 44952.385416666664 | 8.693 |
| 44952.395833333336 | 8.723 |
| 44952.40625 | 8.729 |
| 44952.416666666664 | 8.712 |
| 44952.427083333336 | 8.704 |
| 44952.4375 | 8.707 |
| 44952.447916666664 | 8.735 |
| 44952.458333333336 | 8.754 |
| 44952.46875 | 8.764 |
| 44952.479166666664 | 8.721 |
| 44952.489583333336 | 8.663 |
| 44952.5 | 8.658 |
| 44952.510416666664 | 8.626 |
| 44952.520833333336 | 8.585 |
| 44952.53125 | 8.544 |
| 44952.541666666664 | 8.505 |
| 44952.552083333336 | 8.455 |
| 44952.5625 | 8.414 |
| 44952.572916666664 | 8.365 |
| 44952.583333333336 | 8.32 |
| 44952.59375 | 8.294 |
| 44952.604166666664 | 8.275 |
| 44952.614583333336 | 8.266 |
| 44952.625 | 8.259 |
| 44952.635416666664 | 8.267 |
| 44952.645833333336 | 8.265 |
| 44952.65625 | 8.262 |
| 44952.666666666664 | 8.284 |
| 44952.677083333336 | 8.313 |
| 44952.6875 | 8.352 |
| 44952.697916666664 | 8.395 |
| 44952.708333333336 | 8.433 |
| 44952.71875 | 8.462 |
| 44952.729166666664 | 8.519 |
| 44952.739583333336 | 8.524 |
| 44952.75 | 8.576 |
| 44952.760416666664 | 8.684 |
| 44952.770833333336 | 8.849 |
| 44952.78125 | 9.308 |
| 44952.791666666664 | 9.239 |
| 44952.802083333336 | 9.256 |
| 44952.8125 | 9.448 |
| 44952.822916666664 | 9.659 |
| 44952.833333333336 | 9.843 |
| 44952.84375 | 9.907 |
| 44952.854166666664 | 9.892 |
| 44952.864583333336 | 10.074 |
| 44952.875 | 10.175 |
| 44952.885416666664 | 10.094 |
| 44952.895833333336 | 10.164 |
| 44952.90625 | 10.188 |
| 44952.916666666664 | 10.188 |
| 44952.927083333336 | 10.15 |
| 44952.9375 | 10.125 |
| 44952.947916666664 | 10.101 |
| 44952.958333333336 | 10.083 |
| 44952.96875 | 10.03 |
| 44952.979166666664 | 9.978 |
| 44952.989583333336 | 9.94 |
| 44953.0 | 9.926 |
| 44953.010416666664 | 9.921 |
| 44953.020833333336 | 9.971 |
| 44953.03125 | 9.975 |
| 44953.041666666664 | 9.889 |
| 44953.052083333336 | 9.798 |
| 44953.0625 | 9.687 |
| 44953.072916666664 | 9.507 |
| 44953.083333333336 | 9.394 |
| 44953.09375 | 9.272 |
| 44953.104166666664 | 9.138 |
| 44953.114583333336 | 8.986 |
| 44953.125 | 8.862 |
| 44953.135416666664 | 8.761 |
| 44953.145833333336 | 8.664 |
| 44953.15625 | 8.587 |
| 44953.166666666664 | 8.522 |
| 44953.177083333336 | 8.458 |
| 44953.1875 | 8.411 |
| 44953.197916666664 | 8.387 |
| 44953.208333333336 | 8.365 |
| 44953.21875 | 8.35 |
| 44953.229166666664 | 8.329 |
| 44953.239583333336 | 8.362 |
| 44953.25 | 8.375 |
| 44953.260416666664 | 8.314 |
| 44953.270833333336 | 8.198 |
| 44953.28125 | 8.159 |
| 44953.291666666664 | 8.135 |
| 44953.302083333336 | 8.098 |
| 44953.3125 | 8.027 |
| 44953.322916666664 | 7.691 |
| 44953.333333333336 | 7.655 |
| 44953.34375 | 7.621 |
| 44953.354166666664 | 7.648 |
| 44953.364583333336 | 7.564 |
| 44953.375 | 7.881 |
| 44953.385416666664 | 7.877 |
| 44953.395833333336 | 7.945 |
| 44953.40625 | 7.912 |
| 44953.416666666664 | 7.871 |
| 44953.427083333336 | 7.83 |
| 44953.4375 | 7.81 |
| 44953.447916666664 | 7.78 |
| 44953.458333333336 | 7.736 |
| 44953.46875 | 7.701 |
| 44953.479166666664 | 7.663 |
| 44953.489583333336 | 7.618 |
| 44953.5 | 7.647 |
| 44953.510416666664 | 7.611 |
| 44953.520833333336 | 7.578 |
| 44953.53125 | 7.476 |
| 44953.541666666664 | 7.608 |
| 44953.552083333336 | 7.629 |
| 44953.5625 | 7.638 |
| 44953.572916666664 | 7.609 |
| 44953.583333333336 | 7.544 |
| 44953.59375 | 7.47 |
| 44953.604166666664 | 7.34 |
| 44953.614583333336 | 7.236 |
| 44953.625 | 7.173 |
| 44953.635416666664 | 7.145 |
| 44953.645833333336 | 7.126 |
| 44953.65625 | 7.106 |
| 44953.666666666664 | 7.131 |
| 44953.677083333336 | 7.206 |
| 44953.6875 | 7.312 |
| 44953.697916666664 | 7.443 |
| 44953.708333333336 | 7.579 |
| 44953.71875 | 7.716 |
| 44953.729166666664 | 7.826 |
| 44953.739583333336 | 7.901 |
| 44953.75 | 7.968 |
| 44953.760416666664 | 8.028 |
| 44953.770833333336 | 8.038 |
| 44953.78125 | 8.1 |
| 44953.791666666664 | 8.173 |
| 44953.802083333336 | 8.282 |
| 44953.8125 | 8.462 |
| 44953.822916666664 | 8.65 |
| 44953.833333333336 | 8.665 |
| 44953.84375 | 8.602 |
| 44953.854166666664 | 8.685 |
| 44953.864583333336 | 8.321 |
| 44953.875 | 8.466 |
| 44953.885416666664 | 8.679 |
| 44953.895833333336 | 8.831 |
| 44953.90625 | 9.003 |
| 44953.916666666664 | 9.047 |
| 44953.927083333336 | 9.132 |
| 44953.9375 | 9.15 |
| 44953.947916666664 | 9.176 |
| 44953.958333333336 | 9.165 |
| 44953.96875 | 9.157 |
| 44953.979166666664 | 9.139 |
| 44953.989583333336 | 9.094 |
| 44954.0 | 9.042 |
| 44954.010416666664 | 9.046 |
| 44954.020833333336 | 8.998 |
| 44954.03125 | 8.92 |
| 44954.041666666664 | 8.805 |
| 44954.052083333336 | 8.91 |
| 44954.0625 | 8.846 |
| 44954.072916666664 | 8.746 |
| 44954.083333333336 | 8.676 |
| 44954.09375 | 8.527 |
| 44954.104166666664 | 8.283 |
| 44954.114583333336 | 8.179 |
| 44954.125 | 7.888 |
| 44954.135416666664 | 7.726 |
| 44954.145833333336 | 7.601 |
| 44954.15625 | 7.493 |
| 44954.166666666664 | 7.387 |
| 44954.177083333336 | 7.333 |
| 44954.1875 | 7.339 |
| 44954.197916666664 | 7.407 |
| 44954.208333333336 | 7.515 |
| 44954.21875 | 7.599 |
| 44954.229166666664 | 7.683 |
| 44954.239583333336 | 7.696 |
| 44954.25 | 7.726 |
| 44954.260416666664 | 7.735 |
| 44954.270833333336 | 7.743 |
| 44954.28125 | 7.729 |
| 44954.291666666664 | 7.65 |
| 44954.302083333336 | 7.536 |
| 44954.3125 | 7.474 |
| 44954.322916666664 | 7.316 |
| 44954.333333333336 | 7.123 |
| 44954.34375 | 7.069 |
| 44954.354166666664 | 6.864 |
| 44954.364583333336 | 6.689 |
| 44954.375 | 7.085 |
| 44954.385416666664 | 6.425 |
| 44954.395833333336 | 6.56 |
| 44954.40625 | 6.605 |
| 44954.416666666664 | 6.535 |
| 44954.427083333336 | 6.558 |
| 44954.4375 | 6.6 |
| 44954.447916666664 | 6.647 |
| 44954.458333333336 | 6.626 |
| 44954.46875 | 6.667 |
| 44954.479166666664 | 6.689 |
| 44954.489583333336 | 6.648 |
| 44954.5 | 6.63 |
| 44954.510416666664 | 6.638 |
| 44954.520833333336 | 6.647 |
| 44954.53125 | 6.657 |
| 44954.541666666664 | 6.659 |
| 44954.552083333336 | 6.601 |
| 44954.5625 | 6.614 |
| 44954.572916666664 | 6.658 |
| 44954.583333333336 | 6.666 |
| 44954.59375 | 6.648 |
| 44954.604166666664 | 6.571 |
| 44954.614583333336 | 6.544 |
| 44954.625 | 6.555 |
| 44954.635416666664 | 6.565 |
| 44954.645833333336 | 6.579 |
| 44954.65625 | 6.613 |
| 44954.666666666664 | 6.66 |
| 44954.677083333336 | 6.727 |
| 44954.6875 | 6.82 |
| 44954.697916666664 | 6.899 |
| 44954.708333333336 | 6.994 |
| 44954.71875 | 7.085 |
| 44954.729166666664 | 7.192 |
| 44954.739583333336 | 7.312 |
| 44954.75 | 7.484 |
| 44954.760416666664 | 7.614 |
| 44954.770833333336 | 7.755 |
| 44954.78125 | 7.859 |
| 44954.791666666664 | 7.938 |
| 44954.802083333336 | 7.836 |
| 44954.8125 | 8.004 |
| 44954.822916666664 | 8.231 |
| 44954.833333333336 | 8.552 |
| 44954.84375 | 8.816 |
| 44954.854166666664 | 8.852 |
| 44954.864583333336 | 8.746 |
| 44954.875 | 8.84 |
| 44954.885416666664 | 8.595 |
| 44954.895833333336 | 8.342 |
| 44954.90625 | 8.478 |
| 44954.916666666664 | 8.635 |
| 44954.927083333336 | 8.909 |
| 44954.9375 | 9.044 |
| 44954.947916666664 | 9.165 |
| 44954.958333333336 | 9.209 |
| 44954.96875 | 9.225 |
| 44954.979166666664 | 9.23 |
| 44954.989583333336 | 9.211 |
| 44955.0 | 9.204 |
| 44955.010416666664 | 9.23 |
| 44955.020833333336 | 9.25 |
| 44955.03125 | 9.232 |
| 44955.041666666664 | 9.251 |
| 44955.052083333336 | 9.238 |
| 44955.0625 | 9.186 |
| 44955.072916666664 | 9.082 |
| 44955.083333333336 | 9.084 |
| 44955.09375 | 9.04 |
| 44955.104166666664 | 8.973 |
| 44955.114583333336 | 8.804 |
| 44955.125 | 8.647 |
| 44955.135416666664 | 8.445 |
| 44955.145833333336 | 8.368 |
| 44955.15625 | 8.173 |
| 44955.166666666664 | 8.049 |
| 44955.177083333336 | 7.907 |
| 44955.1875 | 7.787 |
| 44955.197916666664 | 7.722 |
| 44955.208333333336 | 7.688 |
| 44955.21875 | 7.672 |
| 44955.229166666664 | 7.684 |
| 44955.239583333336 | 7.725 |
| 44955.25 | 7.774 |
| 44955.260416666664 | 7.805 |
| 44955.270833333336 | 7.833 |
| 44955.28125 | 7.854 |
| 44955.291666666664 | 7.861 |
| 44955.302083333336 | 7.862 |
| 44955.3125 | 7.859 |
| 44955.322916666664 | 7.851 |
| 44955.333333333336 | 7.832 |
| 44955.34375 | 7.78 |
| 44955.354166666664 | 7.653 |
| 44955.364583333336 | 7.612 |
| 44955.375 | 7.401 |
| 44955.385416666664 | 7.506 |
| 44955.395833333336 | 7.534 |
| 44955.40625 | 7.547 |
| 44955.416666666664 | 7.205 |
| 44955.427083333336 | 7.157 |
| 44955.4375 | 7.017 |
| 44955.447916666664 | 7.076 |
| 44955.458333333336 | 7.097 |
| 44955.46875 | 7.226 |
| 44955.479166666664 | 7.243 |
| 44955.489583333336 | 7.294 |
| 44955.5 | 7.315 |
| 44955.510416666664 | 7.324 |
| 44955.520833333336 | 7.388 |
| 44955.53125 | 7.384 |
| 44955.541666666664 | 7.353 |
| 44955.552083333336 | 7.347 |
| 44955.5625 | 7.341 |
| 44955.572916666664 | 7.358 |
| 44955.583333333336 | 7.393 |
| 44955.59375 | 7.406 |
| 44955.604166666664 | 7.441 |
| 44955.614583333336 | 7.449 |
| 44955.625 | 7.471 |
| 44955.635416666664 | 7.427 |
| 44955.645833333336 | 7.431 |
| 44955.65625 | 7.418 |
| 44955.666666666664 | 7.442 |
| 44955.677083333336 | 7.476 |
| 44955.6875 | 7.51 |
| 44955.697916666664 | 7.583 |
| 44955.708333333336 | 7.675 |
| 44955.71875 | 7.802 |
| 44955.729166666664 | 7.912 |
| 44955.739583333336 | 7.999 |
| 44955.75 | 8.084 |
| 44955.760416666664 | 8.167 |
| 44955.770833333336 | 8.23 |
| 44955.78125 | 8.279 |
| 44955.791666666664 | 8.318 |
| 44955.802083333336 | 8.367 |
| 44955.8125 | 8.398 |
| 44955.822916666664 | 8.438 |
| 44955.833333333336 | 8.41 |
| 44955.84375 | 8.418 |
| 44955.854166666664 | 8.496 |
| 44955.864583333336 | 8.457 |
| 44955.875 | 8.546 |
| 44955.885416666664 | 8.599 |
| 44955.895833333336 | 8.603 |
| 44955.90625 | 8.593 |
| 44955.916666666664 | 8.582 |
| 44955.927083333336 | 8.587 |
| 44955.9375 | 8.524 |
| 44955.947916666664 | 8.438 |
| 44955.958333333336 | 8.308 |
| 44955.96875 | 8.416 |
| 44955.979166666664 | 8.399 |
| 44955.989583333336 | 8.373 |
| 44956.0 | 8.456 |
| 44956.010416666664 | 8.529 |
| 44956.020833333336 | 8.547 |
| 44956.03125 | 8.614 |
| 44956.041666666664 | 8.64 |
| 44956.052083333336 | 8.663 |
| 44956.0625 | 8.676 |
| 44956.072916666664 | 8.665 |
| 44956.083333333336 | 8.672 |
| 44956.09375 | 8.653 |
| 44956.104166666664 | 8.609 |
| 44956.114583333336 | 8.579 |
| 44956.125 | 8.533 |
| 44956.135416666664 | 8.52 |
| 44956.145833333336 | 8.461 |
| 44956.15625 | 8.432 |
| 44956.166666666664 | 8.418 |
| 44956.177083333336 | 8.399 |
| 44956.1875 | 8.388 |
| 44956.197916666664 | 8.372 |
| 44956.208333333336 | 8.354 |
| 44956.21875 | 8.342 |
| 44956.229166666664 | 8.334 |
| 44956.239583333336 | 8.324 |
| 44956.25 | 8.315 |
| 44956.260416666664 | 8.305 |
| 44956.270833333336 | 8.284 |
| 44956.28125 | 8.236 |
| 44956.291666666664 | 8.197 |
| 44956.302083333336 | 8.172 |
| 44956.3125 | 8.168 |
| 44956.322916666664 | 8.162 |
| 44956.333333333336 | 8.155 |
| 44956.34375 | 8.15 |
| 44956.354166666664 | 8.149 |
| 44956.364583333336 | 8.152 |
| 44956.375 | 8.152 |
| 44956.385416666664 | 8.174 |
| 44956.395833333336 | 8.171 |
| 44956.40625 | 8.165 |
| 44956.416666666664 | 8.186 |
| 44956.427083333336 | 8.168 |
| 44956.4375 | 8.171 |
| 44956.447916666664 | 8.158 |
| 44956.458333333336 | 8.16 |
| 44956.46875 | 8.165 |
| 44956.479166666664 | 8.176 |
| 44956.489583333336 | 8.204 |
| 44956.5 | 8.209 |
| 44956.510416666664 | 8.223 |
| 44956.520833333336 | 8.235 |
| 44956.53125 | 8.25 |
| 44956.541666666664 | 8.271 |
| 44956.552083333336 | 8.299 |
| 44956.5625 | 8.32 |
| 44956.572916666664 | 8.337 |
| 44956.583333333336 | 8.353 |
| 44956.59375 | 8.382 |
| 44956.604166666664 | 8.407 |
| 44956.614583333336 | 8.429 |
| 44956.625 | 8.467 |
| 44956.635416666664 | 8.517 |
| 44956.645833333336 | 8.521 |
| 44956.65625 | 8.502 |
| 44956.666666666664 | 8.465 |
| 44956.677083333336 | 8.457 |
| 44956.6875 | 8.42 |
| 44956.697916666664 | 8.446 |
| 44956.708333333336 | 8.419 |
| 44956.71875 | 8.391 |
| 44956.729166666664 | 8.428 |
| 44956.739583333336 | 8.479 |
| 44956.75 | 8.49 |
| 44956.760416666664 | 8.582 |
| 44956.770833333336 | 8.657 |
| 44956.78125 | 8.603 |
| 44956.791666666664 | 8.624 |
| 44956.802083333336 | 8.666 |
| 44956.8125 | 8.705 |
| 44956.822916666664 | 8.733 |
| 44956.833333333336 | 8.774 |
| 44956.84375 | 8.821 |
| 44956.854166666664 | 8.899 |
| 44956.864583333336 | 8.928 |
| 44956.875 | 8.978 |
| 44956.885416666664 | 9.055 |
| 44956.895833333336 | 9.091 |
| 44956.90625 | 8.974 |
| 44956.916666666664 | 9.035 |
| 44956.927083333336 | 9.2 |
| 44956.9375 | 9.237 |
| 44956.947916666664 | 9.379 |
| 44956.958333333336 | 9.614 |
| 44956.96875 | 9.554 |
| 44956.979166666664 | 9.306 |
| 44956.989583333336 | 9.335 |
| 44957.0 | 9.296 |
| 44957.010416666664 | 9.349 |
| 44957.020833333336 | 9.341 |
| 44957.03125 | 9.412 |
| 44957.041666666664 | 9.388 |
| 44957.052083333336 | 9.43 |
| 44957.0625 | 9.481 |
| 44957.072916666664 | 9.536 |
| 44957.083333333336 | 9.536 |
| 44957.09375 | 9.544 |
| 44957.104166666664 | 9.532 |
| 44957.114583333336 | 9.469 |
| 44957.125 | 9.408 |
| 44957.135416666664 | 9.389 |
| 44957.145833333336 | 9.331 |
| 44957.15625 | 9.283 |
| 44957.166666666664 | 9.214 |
| 44957.177083333336 | 9.164 |
| 44957.1875 | 9.086 |
| 44957.197916666664 | 9.03 |
| 44957.208333333336 | 8.992 |
| 44957.21875 | 8.93 |
| 44957.229166666664 | 8.86 |
| 44957.239583333336 | 8.777 |
| 44957.25 | 8.718 |
| 44957.260416666664 | 8.679 |
| 44957.270833333336 | 8.642 |
| 44957.28125 | 8.611 |
| 44957.291666666664 | 8.581 |
| 44957.302083333336 | 8.562 |
| 44957.3125 | 8.544 |
| 44957.322916666664 | 8.496 |
| 44957.333333333336 | 8.492 |
| 44957.34375 | 8.484 |
| 44957.354166666664 | 8.479 |
| 44957.364583333336 | 8.47 |
| 44957.375 | 8.466 |
| 44957.385416666664 | 8.465 |
| 44957.395833333336 | 8.467 |
| 44957.40625 | 8.47 |
| 44957.416666666664 | 8.484 |
| 44957.427083333336 | 8.501 |
| 44957.4375 | 8.497 |
| 44957.447916666664 | 8.498 |
| 44957.458333333336 | 8.484 |
| 44957.46875 | 8.47 |
| 44957.479166666664 | 8.465 |
| 44957.489583333336 | 8.468 |
| 44957.5 | 8.464 |
| 44957.510416666664 | 8.463 |
| 44957.520833333336 | 8.471 |
| 44957.53125 | 8.5 |
| 44957.541666666664 | 8.531 |
| 44957.552083333336 | 8.619 |
| 44957.5625 | 8.697 |
| 44957.572916666664 | 8.771 |
| 44957.583333333336 | 8.84 |
| 44957.59375 | 8.907 |
| 44957.604166666664 | 8.963 |
| 44957.614583333336 | 8.995 |
| 44957.625 | 9.032 |
| 44957.635416666664 | 9.045 |
| 44957.645833333336 | 9.068 |
| 44957.65625 | 9.1 |
| 44957.666666666664 | 9.135 |
| 44957.677083333336 | 9.181 |
| 44957.6875 | 9.212 |
| 44957.697916666664 | 9.213 |
| 44957.708333333336 | 9.212 |
| 44957.71875 | 9.218 |
| 44957.729166666664 | 9.119 |
| 44957.739583333336 | 9.051 |
| 44957.75 | 8.959 |
| 44957.760416666664 | 8.957 |
| 44957.770833333336 | 8.934 |
| 44957.78125 | 8.944 |
| 44957.791666666664 | 8.923 |
| 44957.802083333336 | 8.907 |
| 44957.8125 | 8.891 |
| 44957.822916666664 | 8.884 |
| 44957.833333333336 | 8.88 |
| 44957.84375 | 8.873 |
| 44957.854166666664 | 8.868 |
| 44957.864583333336 | 8.863 |
| 44957.875 | 8.857 |
| 44957.885416666664 | 8.849 |
| 44957.895833333336 | 8.835 |
| 44957.90625 | 8.828 |
| 44957.916666666664 | 8.811 |
| 44957.927083333336 | 8.797 |
| 44957.9375 | 8.771 |
| 44957.947916666664 | 8.722 |
| 44957.958333333336 | 8.717 |
| 44957.96875 | 8.706 |
| 44957.979166666664 | 8.628 |
| 44957.989583333336 | 8.59 |
| 44958.0 | 8.491 |
| 44958.010416666664 | 8.423 |
| 44958.020833333336 | 8.376 |
| 44958.03125 | 8.362 |
| 44958.041666666664 | 8.411 |
| 44958.052083333336 | 8.335 |
| 44958.0625 | 8.373 |
| 44958.072916666664 | 8.397 |
| 44958.083333333336 | 8.455 |
| 44958.09375 | 8.397 |
| 44958.104166666664 | 8.455 |
| 44958.114583333336 | 8.431 |
| 44958.125 | 8.403 |
| 44958.135416666664 | 8.411 |
| 44958.145833333336 | 8.399 |